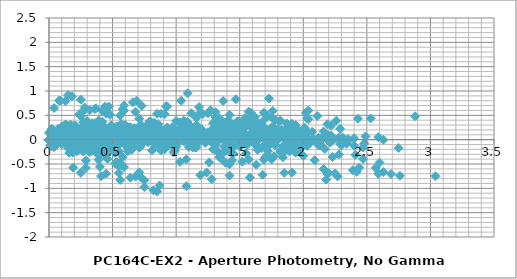
| Category | Series 0 |
|---|---|
| 0.1899999999999995 | -0.091 |
| 1.8800000000000008 | 0.168 |
| 0.2400000000000002 | -0.039 |
| 2.1799999999999997 | 0.033 |
| 1.4399999999999995 | 0.062 |
| 1.6300000000000008 | -0.514 |
| 0.7200000000000006 | 0.01 |
| 0.47000000000000064 | -0.063 |
| 1.9499999999999993 | 0.093 |
| 1.2100000000000009 | 0.073 |
| 1.7599999999999998 | 0.276 |
| 0.13000000000000078 | 0.076 |
| 0.0600000000000005 | -0.084 |
| 0.9499999999999993 | 0.057 |
| 2.08 | 0.018 |
| 0.3800000000000008 | 0.027 |
| 1.0500000000000007 | 0.112 |
| 1.3900000000000006 | 0.009 |
| 0.7799999999999994 | 0.018 |
| 2.0700000000000003 | 0.163 |
| 2.4700000000000006 | -0.395 |
| 0.41000000000000014 | 0.085 |
| 0.4499999999999993 | 0.156 |
| 0.35999999999999943 | 0.09 |
| 1.3499999999999996 | 0.147 |
| 1.9900000000000002 | 0.116 |
| 1.9100000000000001 | 0.101 |
| 1.7799999999999994 | 0.402 |
| 0.21000000000000085 | -0.004 |
| 1.8800000000000008 | 0.309 |
| 0.4399999999999995 | 0.04 |
| 0.0600000000000005 | 0.04 |
| 0.4299999999999997 | 0.024 |
| 1.8100000000000005 | 0.374 |
| 0.040000000000000924 | 0.034 |
| 2.34 | -0.084 |
| 2.2200000000000006 | 0.084 |
| 1.5500000000000007 | 0.289 |
| 2.630000000000001 | -0.665 |
| 1.5899999999999999 | 0.135 |
| 1.540000000000001 | 0.287 |
| 1.2599999999999998 | 0.13 |
| 0.9000000000000004 | 0.18 |
| 1.1600000000000001 | 0.167 |
| 1.6900000000000013 | 0.26 |
| 0.05000000000000071 | 0.052 |
| 1.9900000000000002 | 0.125 |
| 1.25 | 0.154 |
| 1.4400000000000013 | -0.423 |
| 0.5300000000000011 | 0.102 |
| 0.28000000000000114 | 0.028 |
| 1.7599999999999998 | 0.184 |
| 1.0200000000000014 | 0.164 |
| 1.5700000000000003 | 0.367 |
| 0.3200000000000003 | 0.167 |
| 0.129999999999999 | 0.008 |
| 0.7599999999999998 | 0.148 |
| 1.8900000000000006 | 0.11 |
| 0.19000000000000128 | 0.118 |
| 0.8600000000000012 | 0.203 |
| 1.200000000000001 | 0.101 |
| 0.5899999999999999 | 0.109 |
| 1.8800000000000008 | 0.254 |
| 2.280000000000001 | -0.304 |
| 0.5999999999999996 | 0.177 |
| 0.2599999999999998 | 0.248 |
| 0.16999999999999993 | 0.181 |
| 1.1600000000000001 | 0.238 |
| 1.8000000000000007 | 0.207 |
| 1.7200000000000006 | 0.192 |
| 1.5899999999999999 | 0.493 |
| 0.02000000000000135 | 0.088 |
| 1.6900000000000013 | 0.4 |
| 0.25 | 0.131 |
| 0.25 | 0.132 |
| 0.2400000000000002 | 0.115 |
| 1.620000000000001 | 0.465 |
| 0.14999999999999858 | 0.126 |
| 2.1500000000000004 | 0.007 |
| 2.030000000000001 | 0.175 |
| 1.3600000000000012 | 0.38 |
| 2.4400000000000013 | -0.574 |
| 1.4000000000000004 | 0.227 |
| 1.3500000000000014 | 0.378 |
| 1.0700000000000003 | 0.221 |
| 0.7100000000000009 | 0.271 |
| 0.9700000000000006 | 0.258 |
| 1.6400000000000006 | -0.207 |
| 0.29999999999999893 | -0.135 |
| 0.4400000000000013 | -0.106 |
| 0.25 | -0.683 |
| 1.1600000000000001 | -0.158 |
| 1.4100000000000001 | -0.231 |
| 0.06999999999999851 | -0.076 |
| 0.6699999999999999 | -0.096 |
| 0.120000000000001 | 0.108 |
| 2.0100000000000016 | -0.092 |
| 1.8200000000000003 | -0.252 |
| 0.9300000000000015 | -0.111 |
| 0.1999999999999993 | -0.15 |
| 1.5 | -0.142 |
| 0.8300000000000001 | -0.056 |
| 0.4900000000000002 | -0.159 |
| 1.1000000000000014 | -0.151 |
| 0.1899999999999995 | -0.006 |
| 0.5899999999999999 | -0.564 |
| 2.290000000000001 | -0.083 |
| 1.4300000000000015 | -0.012 |
| 1.5200000000000014 | -0.078 |
| 0.5300000000000011 | -0.022 |
| 0.10999999999999943 | -0.052 |
| 0.02999999999999936 | -0.067 |
| 0.10000000000000142 | 0.233 |
| 1.67 | -0.172 |
| 0.0 | 0.141 |
| 1.4400000000000013 | -0.129 |
| 1.9400000000000013 | -0.128 |
| 1.450000000000001 | -0.144 |
| 0.07000000000000028 | 0.206 |
| 1.8399999999999999 | -0.134 |
| 0.4599999999999991 | -0.252 |
| 0.33999999999999986 | -0.085 |
| 0.33000000000000007 | 0.121 |
| 0.75 | -0.834 |
| 0.2900000000000009 | -0.033 |
| 0.33999999999999986 | 0.118 |
| 0.620000000000001 | -0.038 |
| 0.9800000000000004 | 0.011 |
| 0.7200000000000006 | -0.001 |
| 1.9399999999999995 | 0.072 |
| 1.1999999999999993 | 0.101 |
| 1.3900000000000006 | -0.475 |
| 0.4800000000000004 | 0.049 |
| 0.23000000000000043 | -0.024 |
| 1.709999999999999 | 0.132 |
| 0.9700000000000006 | 0.111 |
| 1.5199999999999996 | 0.315 |
| 0.370000000000001 | 0.115 |
| 0.17999999999999972 | -0.045 |
| 0.7099999999999991 | 0.096 |
| 1.8399999999999999 | 0.057 |
| 0.14000000000000057 | 0.066 |
| 0.8100000000000005 | 0.151 |
| 1.1500000000000004 | 0.048 |
| 0.5399999999999991 | 0.057 |
| 1.83 | 0.202 |
| 2.2300000000000004 | -0.357 |
| 0.6500000000000004 | 0.124 |
| 0.20999999999999908 | 0.195 |
| 0.11999999999999922 | 0.129 |
| 1.1099999999999994 | 0.185 |
| 1.75 | 0.155 |
| 1.67 | 0.14 |
| 1.5399999999999991 | 0.441 |
| 0.02999999999999936 | 0.035 |
| 1.6400000000000006 | 0.348 |
| 0.1999999999999993 | 0.078 |
| 0.3000000000000007 | 0.079 |
| 0.1899999999999995 | 0.063 |
| 1.5700000000000003 | 0.413 |
| 0.1999999999999993 | 0.073 |
| 2.0999999999999996 | -0.045 |
| 1.9800000000000004 | 0.123 |
| 1.3100000000000005 | 0.328 |
| 2.3900000000000006 | -0.627 |
| 1.3499999999999996 | 0.174 |
| 1.3000000000000007 | 0.326 |
| 1.0199999999999996 | 0.169 |
| 0.6600000000000001 | 0.219 |
| 0.9199999999999999 | 0.206 |
| 0.7400000000000002 | 0.029 |
| 0.5499999999999989 | -0.548 |
| 1.459999999999999 | -0.023 |
| 1.709999999999999 | -0.096 |
| 0.23000000000000043 | 0.06 |
| 0.9699999999999989 | 0.039 |
| 0.41999999999999993 | 0.243 |
| 2.3100000000000005 | 0.043 |
| 2.119999999999999 | -0.117 |
| 1.2300000000000004 | 0.024 |
| 0.09999999999999964 | -0.015 |
| 1.799999999999999 | -0.007 |
| 1.129999999999999 | 0.079 |
| 0.7899999999999991 | -0.024 |
| 1.4000000000000004 | -0.016 |
| 0.10999999999999943 | 0.129 |
| 0.2900000000000009 | -0.429 |
| 2.59 | 0.052 |
| 1.7300000000000004 | 0.123 |
| 1.8200000000000003 | 0.057 |
| 0.8300000000000001 | 0.113 |
| 0.1899999999999995 | 0.083 |
| 0.2699999999999996 | 0.068 |
| 0.40000000000000036 | 0.368 |
| 1.9699999999999989 | -0.037 |
| 0.29999999999999893 | 0.276 |
| 1.7400000000000002 | 0.006 |
| 2.24 | 0.007 |
| 1.75 | -0.009 |
| 0.3699999999999992 | 0.341 |
| 2.139999999999999 | 0.001 |
| 0.16000000000000014 | -0.117 |
| 0.040000000000000924 | 0.05 |
| 0.629999999999999 | 0.256 |
| 0.45000000000000107 | -0.699 |
| 0.5899999999999999 | 0.102 |
| 0.6399999999999988 | 0.253 |
| 0.9199999999999999 | 0.097 |
| 1.2799999999999994 | 0.146 |
| 1.0199999999999996 | 0.134 |
| 0.19000000000000128 | -0.577 |
| 0.7199999999999989 | -0.052 |
| 0.9699999999999989 | -0.125 |
| 0.5099999999999998 | 0.031 |
| 0.22999999999999865 | 0.01 |
| 0.3200000000000003 | 0.214 |
| 1.5700000000000003 | 0.014 |
| 1.379999999999999 | -0.146 |
| 0.4900000000000002 | -0.005 |
| 0.6400000000000006 | -0.044 |
| 1.0599999999999987 | -0.036 |
| 0.3899999999999988 | 0.05 |
| 0.049999999999998934 | -0.053 |
| 0.6600000000000001 | -0.045 |
| 0.6300000000000008 | 0.1 |
| 1.0300000000000011 | -0.458 |
| 1.8499999999999996 | 0.023 |
| 0.9900000000000002 | 0.094 |
| 1.08 | 0.028 |
| 0.08999999999999986 | 0.084 |
| 0.5500000000000007 | 0.054 |
| 0.47000000000000064 | 0.039 |
| 0.33999999999999986 | 0.339 |
| 1.2299999999999986 | -0.066 |
| 0.4400000000000013 | 0.247 |
| 1.0 | -0.023 |
| 1.5 | -0.022 |
| 1.0099999999999998 | -0.038 |
| 0.370000000000001 | 0.312 |
| 1.3999999999999986 | -0.028 |
| 0.9000000000000004 | -0.146 |
| 0.7800000000000011 | 0.021 |
| 0.11000000000000121 | 0.227 |
| 1.1900000000000013 | -0.728 |
| 0.15000000000000036 | 0.073 |
| 0.10000000000000142 | 0.224 |
| 0.17999999999999972 | 0.068 |
| 0.5399999999999991 | 0.117 |
| 0.27999999999999936 | 0.105 |
| 0.9100000000000001 | 0.525 |
| 1.1600000000000001 | 0.451 |
| 0.3199999999999985 | 0.607 |
| 0.41999999999999993 | 0.587 |
| 0.129999999999999 | 0.79 |
| 1.7600000000000016 | 0.59 |
| 1.5700000000000003 | 0.431 |
| 0.6800000000000015 | 0.571 |
| 0.4499999999999993 | 0.532 |
| 1.25 | 0.541 |
| 0.5800000000000001 | 0.626 |
| 0.2400000000000002 | 0.524 |
| 0.8500000000000014 | 0.532 |
| 0.4399999999999995 | 0.677 |
| 0.8399999999999999 | 0.119 |
| 2.040000000000001 | 0.6 |
| 1.1800000000000015 | 0.67 |
| 1.2700000000000014 | 0.604 |
| 0.28000000000000114 | 0.661 |
| 0.35999999999999943 | 0.63 |
| 0.27999999999999936 | 0.615 |
| 0.14999999999999858 | 0.916 |
| 1.42 | 0.511 |
| 0.25 | 0.823 |
| 1.1900000000000013 | 0.554 |
| 1.6900000000000013 | 0.554 |
| 1.200000000000001 | 0.538 |
| 0.17999999999999972 | 0.888 |
| 1.5899999999999999 | 0.549 |
| 0.7099999999999991 | 0.43 |
| 0.5899999999999999 | 0.598 |
| 0.08000000000000007 | 0.803 |
| 1.0 | -0.151 |
| 0.040000000000000924 | 0.65 |
| 0.08999999999999986 | 0.801 |
| 0.370000000000001 | 0.644 |
| 0.7300000000000004 | 0.694 |
| 0.47000000000000064 | 0.681 |
| 0.25 | -0.074 |
| 1.2299999999999986 | 0.082 |
| 0.4900000000000002 | 0.062 |
| 1.0399999999999991 | 0.266 |
| 0.8500000000000014 | 0.065 |
| 0.6600000000000001 | -0.094 |
| 0.22999999999999865 | 0.047 |
| 1.3599999999999994 | 0.008 |
| 0.33999999999999986 | 0.016 |
| 0.33000000000000007 | 0.102 |
| 0.6699999999999999 | -0.001 |
| 0.05999999999999872 | 0.007 |
| 1.3499999999999996 | 0.152 |
| 1.75 | -0.406 |
| 1.1300000000000008 | 0.075 |
| 0.27000000000000135 | 0.146 |
| 0.3600000000000012 | 0.08 |
| 0.629999999999999 | 0.136 |
| 1.2699999999999996 | 0.105 |
| 1.1899999999999995 | 0.091 |
| 1.0599999999999987 | 0.391 |
| 0.5099999999999998 | -0.014 |
| 1.1600000000000001 | 0.299 |
| 0.28000000000000114 | 0.029 |
| 0.7800000000000011 | 0.03 |
| 0.2900000000000009 | 0.014 |
| 1.0899999999999999 | 0.363 |
| 0.6799999999999997 | 0.024 |
| 1.6199999999999992 | -0.094 |
| 1.5 | 0.073 |
| 0.8300000000000001 | 0.279 |
| 1.9100000000000001 | -0.676 |
| 0.8699999999999992 | 0.125 |
| 0.8200000000000003 | 0.276 |
| 0.5399999999999991 | 0.12 |
| 0.17999999999999972 | 0.169 |
| 0.4399999999999995 | 0.157 |
| 1.4799999999999986 | 0.156 |
| 0.7400000000000002 | 0.136 |
| 1.2899999999999991 | 0.339 |
| 0.6000000000000014 | 0.139 |
| 0.41000000000000014 | -0.021 |
| 0.47999999999999865 | 0.12 |
| 1.6099999999999994 | 0.081 |
| 0.08999999999999986 | 0.09 |
| 0.5800000000000001 | 0.175 |
| 0.9199999999999999 | 0.072 |
| 0.3099999999999987 | 0.081 |
| 1.5999999999999996 | 0.226 |
| 2.0 | -0.332 |
| 0.8800000000000008 | 0.148 |
| 0.02000000000000135 | 0.219 |
| 0.11000000000000121 | 0.153 |
| 0.879999999999999 | 0.21 |
| 1.5199999999999996 | 0.179 |
| 1.4399999999999995 | 0.164 |
| 1.3099999999999987 | 0.465 |
| 0.2599999999999998 | 0.059 |
| 1.4100000000000001 | 0.372 |
| 0.030000000000001137 | 0.103 |
| 0.5300000000000011 | 0.103 |
| 0.040000000000000924 | 0.087 |
| 1.3399999999999999 | 0.437 |
| 0.4299999999999997 | 0.097 |
| 1.8699999999999992 | -0.021 |
| 1.75 | 0.147 |
| 1.08 | 0.352 |
| 2.16 | -0.602 |
| 1.1199999999999992 | 0.199 |
| 1.0700000000000003 | 0.35 |
| 0.7899999999999991 | 0.193 |
| 0.4299999999999997 | 0.243 |
| 0.6899999999999995 | 0.23 |
| 0.7399999999999984 | -0.02 |
| 0.1899999999999995 | 0.183 |
| 2.08 | -0.017 |
| 1.8899999999999988 | -0.176 |
| 1.0 | -0.036 |
| 0.13000000000000078 | -0.075 |
| 1.5699999999999985 | -0.066 |
| 0.8999999999999986 | 0.019 |
| 0.5599999999999987 | -0.084 |
| 1.17 | -0.075 |
| 0.120000000000001 | 0.07 |
| 0.5200000000000014 | -0.488 |
| 2.3599999999999994 | -0.008 |
| 1.5 | 0.063 |
| 1.5899999999999999 | -0.003 |
| 0.5999999999999996 | 0.054 |
| 0.040000000000000924 | 0.023 |
| 0.03999999999999915 | 0.008 |
| 0.16999999999999993 | 0.309 |
| 1.7399999999999984 | -0.097 |
| 0.06999999999999851 | 0.216 |
| 1.5099999999999998 | -0.053 |
| 2.01 | -0.053 |
| 1.5199999999999996 | -0.069 |
| 0.1399999999999988 | 0.281 |
| 1.9099999999999984 | -0.059 |
| 0.39000000000000057 | -0.177 |
| 0.27000000000000135 | -0.009 |
| 0.3999999999999986 | 0.196 |
| 0.6800000000000015 | -0.758 |
| 0.35999999999999943 | 0.043 |
| 0.40999999999999837 | 0.194 |
| 0.6899999999999995 | 0.037 |
| 1.049999999999999 | 0.087 |
| 0.7899999999999991 | 0.074 |
| 0.5499999999999989 | 0.203 |
| 1.3400000000000016 | 0.003 |
| 1.1500000000000004 | -0.156 |
| 0.26000000000000156 | -0.016 |
| 0.8699999999999992 | -0.054 |
| 0.8300000000000001 | -0.046 |
| 0.16000000000000014 | 0.039 |
| 0.17999999999999972 | -0.063 |
| 0.4300000000000015 | -0.055 |
| 0.8599999999999994 | 0.09 |
| 1.2599999999999998 | -0.468 |
| 1.620000000000001 | 0.013 |
| 0.7600000000000016 | 0.084 |
| 0.8500000000000014 | 0.017 |
| 0.1399999999999988 | 0.074 |
| 0.7799999999999994 | 0.043 |
| 0.6999999999999993 | 0.029 |
| 0.5699999999999985 | 0.329 |
| 1.0 | -0.076 |
| 0.6699999999999999 | 0.236 |
| 0.7700000000000014 | -0.033 |
| 1.2700000000000014 | -0.032 |
| 0.7800000000000011 | -0.048 |
| 0.5999999999999996 | 0.301 |
| 1.17 | -0.038 |
| 1.129999999999999 | -0.156 |
| 1.0099999999999998 | 0.011 |
| 0.33999999999999986 | 0.216 |
| 1.42 | -0.738 |
| 0.379999999999999 | 0.063 |
| 0.33000000000000007 | 0.214 |
| 0.049999999999998934 | 0.058 |
| 0.3100000000000005 | 0.107 |
| 0.05000000000000071 | 0.094 |
| 1.8900000000000006 | -0.2 |
| 1.6999999999999993 | -0.36 |
| 0.8100000000000005 | -0.219 |
| 0.3200000000000003 | -0.258 |
| 1.379999999999999 | -0.249 |
| 0.7099999999999991 | -0.164 |
| 0.3699999999999992 | -0.267 |
| 0.9800000000000004 | -0.258 |
| 0.3100000000000005 | -0.113 |
| 0.7100000000000009 | -0.671 |
| 2.17 | -0.191 |
| 1.3100000000000005 | -0.12 |
| 1.4000000000000004 | -0.186 |
| 0.41000000000000014 | -0.13 |
| 0.23000000000000043 | -0.16 |
| 0.15000000000000036 | -0.175 |
| 0.019999999999999574 | 0.126 |
| 1.549999999999999 | -0.28 |
| 0.120000000000001 | 0.033 |
| 1.3200000000000003 | -0.236 |
| 1.8200000000000003 | -0.236 |
| 1.33 | -0.252 |
| 0.05000000000000071 | 0.098 |
| 1.7199999999999989 | -0.242 |
| 0.5800000000000001 | -0.36 |
| 0.46000000000000085 | -0.192 |
| 0.20999999999999908 | 0.013 |
| 0.870000000000001 | -0.941 |
| 0.16999999999999993 | -0.141 |
| 0.21999999999999886 | 0.011 |
| 0.5 | -0.146 |
| 0.8599999999999994 | -0.096 |
| 0.5999999999999996 | -0.109 |
| 0.19000000000000128 | -0.16 |
| 1.08 | -0.019 |
| 2.210000000000001 | -0.058 |
| 0.5100000000000016 | -0.049 |
| 1.1800000000000015 | 0.036 |
| 1.5200000000000014 | -0.067 |
| 0.9100000000000001 | -0.058 |
| 2.200000000000001 | 0.087 |
| 2.6000000000000014 | -0.471 |
| 0.27999999999999936 | 0.009 |
| 0.5800000000000001 | 0.08 |
| 0.4900000000000002 | 0.014 |
| 1.4800000000000004 | 0.071 |
| 2.120000000000001 | 0.04 |
| 2.040000000000001 | 0.025 |
| 1.9100000000000001 | 0.326 |
| 0.34000000000000163 | -0.08 |
| 2.0100000000000016 | 0.233 |
| 0.5700000000000003 | -0.036 |
| 0.07000000000000028 | -0.036 |
| 0.5600000000000005 | -0.052 |
| 1.9400000000000013 | 0.298 |
| 0.1700000000000017 | -0.042 |
| 2.4700000000000006 | -0.16 |
| 2.3500000000000014 | 0.008 |
| 1.6800000000000015 | 0.213 |
| 2.7600000000000016 | -0.741 |
| 1.7200000000000006 | 0.06 |
| 1.6700000000000017 | 0.211 |
| 1.3900000000000006 | 0.054 |
| 1.0300000000000011 | 0.104 |
| 1.290000000000001 | 0.091 |
| 0.8899999999999988 | 0.141 |
| 2.0199999999999996 | 0.102 |
| 0.3200000000000003 | 0.11 |
| 0.9900000000000002 | 0.196 |
| 1.33 | 0.093 |
| 0.7199999999999989 | 0.101 |
| 2.01 | 0.246 |
| 2.41 | -0.312 |
| 0.47000000000000064 | 0.169 |
| 0.3899999999999988 | 0.24 |
| 0.29999999999999893 | 0.174 |
| 1.2899999999999991 | 0.23 |
| 1.9299999999999997 | 0.2 |
| 1.8499999999999996 | 0.185 |
| 1.7199999999999989 | 0.485 |
| 0.15000000000000036 | 0.08 |
| 1.8200000000000003 | 0.393 |
| 0.379999999999999 | 0.123 |
| 0.120000000000001 | 0.124 |
| 0.3699999999999992 | 0.108 |
| 1.75 | 0.457 |
| 0.019999999999999574 | 0.118 |
| 2.2799999999999994 | 0 |
| 2.16 | 0.167 |
| 1.4900000000000002 | 0.373 |
| 2.5700000000000003 | -0.582 |
| 1.5299999999999994 | 0.219 |
| 1.4800000000000004 | 0.37 |
| 1.1999999999999993 | 0.214 |
| 0.8399999999999999 | 0.263 |
| 1.0999999999999996 | 0.251 |
| 1.1300000000000008 | -0.039 |
| 0.5699999999999985 | -0.03 |
| 0.10000000000000142 | 0.055 |
| 0.4400000000000013 | -0.048 |
| 0.16999999999999993 | -0.039 |
| 1.120000000000001 | 0.106 |
| 1.5200000000000014 | -0.452 |
| 1.3599999999999994 | 0.028 |
| 0.5 | 0.099 |
| 0.5899999999999999 | 0.033 |
| 0.40000000000000036 | 0.09 |
| 1.040000000000001 | 0.059 |
| 0.9600000000000009 | 0.044 |
| 0.8300000000000001 | 0.345 |
| 0.7399999999999984 | -0.061 |
| 0.9300000000000015 | 0.252 |
| 0.5099999999999998 | -0.017 |
| 1.0099999999999998 | -0.017 |
| 0.5199999999999996 | -0.033 |
| 0.8600000000000012 | 0.317 |
| 0.9099999999999984 | -0.023 |
| 1.3900000000000006 | -0.141 |
| 1.2700000000000014 | 0.027 |
| 0.6000000000000014 | 0.232 |
| 1.6800000000000015 | -0.722 |
| 0.6400000000000006 | 0.079 |
| 0.5900000000000016 | 0.23 |
| 0.3100000000000005 | 0.073 |
| 0.049999999999998934 | 0.123 |
| 0.21000000000000085 | 0.11 |
| 1.6999999999999993 | 0.009 |
| 1.0299999999999994 | 0.094 |
| 0.6899999999999995 | -0.009 |
| 1.3000000000000007 | -0.001 |
| 0.009999999999999787 | 0.144 |
| 0.39000000000000057 | -0.414 |
| 2.49 | 0.067 |
| 1.6300000000000008 | 0.138 |
| 1.7200000000000006 | 0.072 |
| 0.7300000000000004 | 0.128 |
| 0.08999999999999986 | 0.098 |
| 0.16999999999999993 | 0.083 |
| 0.3000000000000007 | 0.383 |
| 1.8699999999999992 | -0.022 |
| 0.1999999999999993 | 0.291 |
| 1.6400000000000006 | 0.021 |
| 2.1400000000000006 | 0.022 |
| 1.6500000000000004 | 0.006 |
| 0.2699999999999996 | 0.356 |
| 2.039999999999999 | 0.016 |
| 0.2599999999999998 | -0.102 |
| 0.14000000000000057 | 0.066 |
| 0.5299999999999994 | 0.271 |
| 0.5500000000000007 | -0.684 |
| 0.4900000000000002 | 0.117 |
| 0.5399999999999991 | 0.269 |
| 0.8200000000000003 | 0.112 |
| 1.1799999999999997 | 0.162 |
| 0.9199999999999999 | 0.149 |
| 0.6699999999999999 | 0.085 |
| 1.0099999999999998 | -0.017 |
| 0.3999999999999986 | -0.009 |
| 1.6899999999999995 | 0.136 |
| 2.09 | -0.422 |
| 0.7900000000000009 | 0.058 |
| 0.06999999999999851 | 0.129 |
| 0.02000000000000135 | 0.063 |
| 0.9699999999999989 | 0.12 |
| 1.6099999999999994 | 0.089 |
| 1.5299999999999994 | 0.074 |
| 1.3999999999999986 | 0.375 |
| 0.16999999999999993 | -0.031 |
| 1.5 | 0.282 |
| 0.05999999999999872 | 0.013 |
| 0.4400000000000013 | 0.013 |
| 0.049999999999998934 | -0.003 |
| 1.4299999999999997 | 0.347 |
| 0.33999999999999986 | 0.007 |
| 1.959999999999999 | -0.111 |
| 1.8399999999999999 | 0.057 |
| 1.17 | 0.262 |
| 2.25 | -0.692 |
| 1.209999999999999 | 0.109 |
| 1.1600000000000001 | 0.26 |
| 0.879999999999999 | 0.103 |
| 0.5199999999999996 | 0.153 |
| 0.7799999999999994 | 0.14 |
| 0.33999999999999986 | -0.103 |
| 0.27000000000000135 | -0.094 |
| 1.0199999999999996 | 0.051 |
| 1.42 | -0.507 |
| 1.4600000000000009 | -0.027 |
| 0.6000000000000014 | 0.044 |
| 0.6900000000000013 | -0.022 |
| 0.29999999999999893 | 0.034 |
| 0.9399999999999995 | 0.004 |
| 0.8599999999999994 | -0.011 |
| 0.7299999999999986 | 0.29 |
| 0.8399999999999999 | -0.116 |
| 0.8300000000000001 | 0.197 |
| 0.6100000000000012 | -0.072 |
| 1.1100000000000012 | -0.072 |
| 0.620000000000001 | -0.088 |
| 0.7599999999999998 | 0.262 |
| 1.0099999999999998 | -0.078 |
| 1.2899999999999991 | -0.196 |
| 1.17 | -0.028 |
| 0.5 | 0.177 |
| 1.58 | -0.777 |
| 0.5399999999999991 | 0.023 |
| 0.4900000000000002 | 0.175 |
| 0.20999999999999908 | 0.018 |
| 0.15000000000000036 | 0.068 |
| 0.10999999999999943 | 0.055 |
| 0.6100000000000012 | 0.008 |
| 0.6799999999999997 | 0.153 |
| 1.08 | -0.405 |
| 1.8000000000000007 | 0.076 |
| 0.9400000000000013 | 0.147 |
| 1.0300000000000011 | 0.081 |
| 0.040000000000000924 | 0.137 |
| 0.5999999999999996 | 0.107 |
| 0.5199999999999996 | 0.092 |
| 0.3899999999999988 | 0.392 |
| 1.1799999999999997 | -0.013 |
| 0.4900000000000002 | 0.3 |
| 0.9500000000000011 | 0.03 |
| 1.450000000000001 | 0.031 |
| 0.9600000000000009 | 0.015 |
| 0.41999999999999993 | 0.365 |
| 1.3499999999999996 | 0.025 |
| 0.9499999999999993 | -0.093 |
| 0.8300000000000001 | 0.074 |
| 0.16000000000000014 | 0.28 |
| 1.2400000000000002 | -0.675 |
| 0.1999999999999993 | 0.126 |
| 0.15000000000000036 | 0.277 |
| 0.13000000000000078 | 0.121 |
| 0.4900000000000002 | 0.17 |
| 0.23000000000000043 | 0.158 |
| 1.290000000000001 | 0.145 |
| 1.6900000000000013 | -0.413 |
| 1.1899999999999995 | 0.068 |
| 0.33000000000000007 | 0.139 |
| 0.41999999999999993 | 0.072 |
| 0.5700000000000003 | 0.129 |
| 1.2100000000000009 | 0.098 |
| 1.1300000000000008 | 0.083 |
| 1.0 | 0.384 |
| 0.5699999999999985 | -0.021 |
| 1.1000000000000014 | 0.291 |
| 0.33999999999999986 | 0.022 |
| 0.8399999999999999 | 0.022 |
| 0.34999999999999964 | 0.006 |
| 1.0300000000000011 | 0.356 |
| 0.7399999999999984 | 0.017 |
| 1.5600000000000005 | -0.102 |
| 1.4400000000000013 | 0.066 |
| 0.7700000000000014 | 0.271 |
| 1.8500000000000014 | -0.683 |
| 0.8100000000000005 | 0.118 |
| 0.7600000000000016 | 0.269 |
| 0.4800000000000004 | 0.112 |
| 0.120000000000001 | 0.162 |
| 0.3800000000000008 | 0.149 |
| 0.40000000000000036 | -0.558 |
| 2.4800000000000004 | -0.077 |
| 1.620000000000001 | -0.006 |
| 1.7100000000000009 | -0.073 |
| 0.7200000000000006 | -0.016 |
| 0.08000000000000007 | -0.047 |
| 0.16000000000000014 | -0.062 |
| 0.2900000000000009 | 0.239 |
| 1.8599999999999994 | -0.166 |
| 0.1899999999999995 | 0.146 |
| 1.6300000000000008 | -0.123 |
| 2.130000000000001 | -0.123 |
| 1.6400000000000006 | -0.139 |
| 0.2599999999999998 | 0.211 |
| 2.0299999999999994 | -0.128 |
| 0.2699999999999996 | -0.247 |
| 0.15000000000000036 | -0.079 |
| 0.5199999999999996 | 0.126 |
| 0.5600000000000005 | -0.828 |
| 0.4800000000000004 | -0.027 |
| 0.5299999999999994 | 0.124 |
| 0.8100000000000005 | -0.033 |
| 1.17 | 0.017 |
| 0.9100000000000001 | 0.004 |
| 2.880000000000001 | 0.481 |
| 2.0200000000000014 | 0.552 |
| 2.110000000000001 | 0.486 |
| 1.120000000000001 | 0.542 |
| 0.4800000000000004 | 0.511 |
| 0.5600000000000005 | 0.497 |
| 0.6900000000000013 | 0.797 |
| 2.26 | 0.392 |
| 0.5899999999999999 | 0.704 |
| 2.030000000000001 | 0.435 |
| 2.530000000000001 | 0.436 |
| 2.040000000000001 | 0.42 |
| 0.6600000000000001 | 0.769 |
| 2.4299999999999997 | 0.43 |
| 0.13000000000000078 | 0.312 |
| 0.25 | 0.479 |
| 0.9199999999999999 | 0.684 |
| 0.16000000000000014 | -0.27 |
| 0.8800000000000008 | 0.531 |
| 0.9299999999999997 | 0.682 |
| 1.2100000000000009 | 0.526 |
| 1.5700000000000003 | 0.575 |
| 1.3100000000000005 | 0.562 |
| 0.8599999999999994 | 0.071 |
| 0.7699999999999996 | 0.005 |
| 1.7599999999999998 | 0.061 |
| 2.4000000000000004 | 0.031 |
| 2.3200000000000003 | 0.016 |
| 2.1899999999999995 | 0.316 |
| 0.620000000000001 | -0.089 |
| 2.290000000000001 | 0.224 |
| 0.8499999999999996 | -0.046 |
| 0.34999999999999964 | -0.045 |
| 0.8399999999999999 | -0.061 |
| 2.2200000000000006 | 0.289 |
| 0.45000000000000107 | -0.051 |
| 2.75 | -0.169 |
| 2.630000000000001 | -0.002 |
| 1.9600000000000009 | 0.204 |
| 3.040000000000001 | -0.751 |
| 2.0 | 0.05 |
| 1.950000000000001 | 0.202 |
| 1.67 | 0.045 |
| 1.3100000000000005 | 0.095 |
| 1.5700000000000003 | 0.082 |
| 0.08999999999999986 | -0.066 |
| 0.9000000000000004 | -0.01 |
| 1.540000000000001 | -0.04 |
| 1.4600000000000009 | -0.055 |
| 1.33 | 0.245 |
| 0.23999999999999844 | -0.16 |
| 1.4300000000000015 | 0.153 |
| 0.009999999999999787 | -0.117 |
| 0.5099999999999998 | -0.116 |
| 0.019999999999999574 | -0.132 |
| 1.3600000000000012 | 0.218 |
| 0.40999999999999837 | -0.122 |
| 1.8900000000000006 | -0.24 |
| 1.7700000000000014 | -0.072 |
| 1.1000000000000014 | 0.133 |
| 2.1800000000000015 | -0.822 |
| 1.1400000000000006 | -0.021 |
| 1.0900000000000016 | 0.131 |
| 0.8100000000000005 | -0.026 |
| 0.45000000000000107 | 0.024 |
| 0.7100000000000009 | 0.011 |
| 0.9900000000000002 | 0.056 |
| 1.6300000000000008 | 0.026 |
| 1.5500000000000007 | 0.011 |
| 1.42 | 0.312 |
| 0.14999999999999858 | -0.094 |
| 1.5200000000000014 | 0.219 |
| 0.08000000000000007 | -0.051 |
| 0.41999999999999993 | -0.05 |
| 0.07000000000000028 | -0.066 |
| 1.450000000000001 | 0.284 |
| 0.3199999999999985 | -0.056 |
| 1.9800000000000004 | -0.174 |
| 1.8600000000000012 | -0.006 |
| 1.1900000000000013 | 0.199 |
| 2.2700000000000014 | -0.755 |
| 1.2300000000000004 | 0.045 |
| 1.1800000000000015 | 0.197 |
| 0.9000000000000004 | 0.04 |
| 0.5400000000000009 | 0.09 |
| 0.8000000000000007 | 0.077 |
| 0.6400000000000006 | -0.031 |
| 0.5600000000000005 | -0.045 |
| 0.4299999999999997 | 0.255 |
| 1.1399999999999988 | -0.15 |
| 0.5300000000000011 | 0.162 |
| 0.9100000000000001 | -0.107 |
| 1.4100000000000001 | -0.106 |
| 0.9199999999999999 | -0.122 |
| 0.46000000000000085 | 0.227 |
| 1.3099999999999987 | -0.112 |
| 0.9900000000000002 | -0.23 |
| 0.870000000000001 | -0.063 |
| 0.20000000000000107 | 0.143 |
| 1.2800000000000011 | -0.812 |
| 0.2400000000000002 | -0.011 |
| 0.19000000000000128 | 0.14 |
| 0.08999999999999986 | -0.016 |
| 0.4499999999999993 | 0.033 |
| 0.1899999999999995 | 0.02 |
| 0.08000000000000007 | -0.015 |
| 0.21000000000000085 | 0.286 |
| 1.7799999999999994 | -0.12 |
| 0.10999999999999943 | 0.193 |
| 1.5500000000000007 | -0.076 |
| 2.0500000000000007 | -0.076 |
| 1.5600000000000005 | -0.092 |
| 0.17999999999999972 | 0.258 |
| 1.9499999999999993 | -0.082 |
| 0.34999999999999964 | -0.2 |
| 0.23000000000000043 | -0.032 |
| 0.4399999999999995 | 0.173 |
| 0.6400000000000006 | -0.781 |
| 0.40000000000000036 | 0.02 |
| 0.4499999999999993 | 0.171 |
| 0.7300000000000004 | 0.014 |
| 1.0899999999999999 | 0.064 |
| 0.8300000000000001 | 0.051 |
| 0.13000000000000078 | 0.301 |
| 1.6999999999999993 | -0.105 |
| 0.02999999999999936 | 0.208 |
| 1.4700000000000006 | -0.062 |
| 1.9700000000000006 | -0.061 |
| 1.4800000000000004 | -0.077 |
| 0.09999999999999964 | 0.273 |
| 1.8699999999999992 | -0.067 |
| 0.4299999999999997 | -0.185 |
| 0.3100000000000005 | -0.017 |
| 0.35999999999999943 | 0.188 |
| 0.7200000000000006 | -0.767 |
| 0.3200000000000003 | 0.034 |
| 0.3699999999999992 | 0.186 |
| 0.6500000000000004 | 0.029 |
| 1.0099999999999998 | 0.079 |
| 0.75 | 0.066 |
| 1.5699999999999985 | -0.405 |
| 0.10000000000000142 | -0.093 |
| 1.3399999999999999 | -0.362 |
| 1.8399999999999999 | -0.361 |
| 1.3499999999999996 | -0.378 |
| 0.030000000000001137 | -0.028 |
| 1.7399999999999984 | -0.367 |
| 0.5600000000000005 | -0.486 |
| 0.4400000000000013 | -0.318 |
| 0.22999999999999865 | -0.113 |
| 0.8500000000000014 | -1.067 |
| 0.1899999999999995 | -0.266 |
| 0.23999999999999844 | -0.115 |
| 0.5199999999999996 | -0.272 |
| 0.879999999999999 | -0.222 |
| 0.6199999999999992 | -0.235 |
| 1.67 | 0.313 |
| 0.22999999999999865 | 0.043 |
| 0.27000000000000135 | 0.044 |
| 0.21999999999999886 | 0.028 |
| 1.5999999999999996 | 0.378 |
| 0.16999999999999993 | 0.038 |
| 2.129999999999999 | -0.08 |
| 2.01 | 0.087 |
| 1.3399999999999999 | 0.293 |
| 2.42 | -0.662 |
| 1.379999999999999 | 0.139 |
| 1.33 | 0.291 |
| 1.049999999999999 | 0.134 |
| 0.6899999999999995 | 0.184 |
| 0.9499999999999993 | 0.171 |
| 1.4400000000000013 | -0.269 |
| 1.9400000000000013 | -0.269 |
| 1.450000000000001 | -0.285 |
| 0.07000000000000028 | 0.065 |
| 1.8399999999999999 | -0.275 |
| 0.4599999999999991 | -0.393 |
| 0.33999999999999986 | -0.225 |
| 0.33000000000000007 | -0.02 |
| 0.75 | -0.974 |
| 0.2900000000000009 | -0.173 |
| 0.33999999999999986 | -0.022 |
| 0.620000000000001 | -0.179 |
| 0.9800000000000004 | -0.129 |
| 0.7200000000000006 | -0.142 |
| 0.5 | 0.001 |
| 0.009999999999999787 | -0.015 |
| 1.370000000000001 | 0.334 |
| 0.3999999999999986 | -0.005 |
| 1.9000000000000004 | -0.123 |
| 1.7800000000000011 | 0.044 |
| 1.1100000000000012 | 0.249 |
| 2.1900000000000013 | -0.705 |
| 1.1500000000000004 | 0.096 |
| 1.1000000000000014 | 0.247 |
| 0.8200000000000003 | 0.091 |
| 0.46000000000000085 | 0.14 |
| 0.7200000000000006 | 0.127 |
| 0.4900000000000002 | -0.016 |
| 1.870000000000001 | 0.334 |
| 0.10000000000000142 | -0.006 |
| 2.4000000000000004 | -0.124 |
| 2.280000000000001 | 0.044 |
| 1.6100000000000012 | 0.249 |
| 2.6900000000000013 | -0.706 |
| 1.6500000000000004 | 0.095 |
| 1.6000000000000014 | 0.247 |
| 1.3200000000000003 | 0.09 |
| 0.9600000000000009 | 0.14 |
| 1.2200000000000006 | 0.127 |
| 1.3800000000000008 | 0.35 |
| 0.3899999999999988 | 0.01 |
| 1.9100000000000001 | -0.108 |
| 1.790000000000001 | 0.06 |
| 1.120000000000001 | 0.265 |
| 2.200000000000001 | -0.69 |
| 1.1600000000000001 | 0.111 |
| 1.1100000000000012 | 0.263 |
| 0.8300000000000001 | 0.106 |
| 0.47000000000000064 | 0.156 |
| 0.7300000000000004 | 0.143 |
| 1.7699999999999996 | -0.34 |
| 0.5299999999999994 | -0.458 |
| 0.41000000000000014 | -0.29 |
| 0.2599999999999998 | -0.085 |
| 0.8200000000000003 | -1.039 |
| 0.22000000000000064 | -0.238 |
| 0.2699999999999996 | -0.087 |
| 0.5500000000000007 | -0.244 |
| 0.9100000000000001 | -0.194 |
| 0.6500000000000004 | -0.207 |
| 2.299999999999999 | -0.118 |
| 2.1799999999999997 | 0.049 |
| 1.5099999999999998 | 0.255 |
| 2.59 | -0.7 |
| 1.549999999999999 | 0.101 |
| 1.5 | 0.253 |
| 1.2199999999999989 | 0.096 |
| 0.8599999999999994 | 0.146 |
| 1.1199999999999992 | 0.133 |
| 0.11999999999999922 | 0.168 |
| 0.7899999999999991 | 0.373 |
| 0.2900000000000009 | -0.582 |
| 0.75 | 0.219 |
| 0.7999999999999989 | 0.371 |
| 1.08 | 0.214 |
| 1.4399999999999995 | 0.264 |
| 1.1799999999999997 | 0.251 |
| 0.6699999999999999 | 0.205 |
| 0.41000000000000014 | -0.749 |
| 0.6300000000000008 | 0.052 |
| 0.6799999999999997 | 0.203 |
| 0.9600000000000009 | 0.046 |
| 1.3200000000000003 | 0.096 |
| 1.0600000000000005 | 0.083 |
| 1.08 | -0.954 |
| 0.03999999999999915 | -0.154 |
| 0.009999999999999787 | -0.002 |
| 0.2900000000000009 | -0.159 |
| 0.6500000000000004 | -0.109 |
| 0.39000000000000057 | -0.122 |
| 1.040000000000001 | 0.801 |
| 1.0899999999999999 | 0.952 |
| 1.370000000000001 | 0.796 |
| 1.7300000000000004 | 0.845 |
| 1.4700000000000006 | 0.832 |
| 0.049999999999998934 | 0.151 |
| 0.33000000000000007 | -0.005 |
| 0.6899999999999995 | 0.044 |
| 0.4299999999999997 | 0.032 |
| 0.28000000000000114 | -0.157 |
| 0.6400000000000006 | -0.107 |
| 0.3800000000000008 | -0.12 |
| 0.35999999999999943 | 0.05 |
| 0.09999999999999964 | 0.037 |
| 0.2599999999999998 | -0.013 |
| 0.0 | 0 |
| 0.0 | 0 |
| 0.0 | 0 |
| 0.0 | 0 |
| 0.0 | 0 |
| 0.0 | 0 |
| 0.0 | 0 |
| 0.0 | 0 |
| 0.0 | 0 |
| 0.0 | 0 |
| 0.0 | 0 |
| 0.0 | 0 |
| 0.0 | 0 |
| 0.0 | 0 |
| 0.0 | 0 |
| 0.0 | 0 |
| 0.0 | 0 |
| 0.0 | 0 |
| 0.0 | 0 |
| 0.0 | 0 |
| 0.0 | 0 |
| 0.0 | 0 |
| 0.0 | 0 |
| 0.0 | 0 |
| 0.0 | 0 |
| 0.0 | 0 |
| 0.0 | 0 |
| 0.0 | 0 |
| 0.0 | 0 |
| 0.0 | 0 |
| 0.0 | 0 |
| 0.0 | 0 |
| 0.0 | 0 |
| 0.0 | 0 |
| 0.0 | 0 |
| 0.0 | 0 |
| 0.0 | 0 |
| 0.0 | 0 |
| 0.0 | 0 |
| 0.0 | 0 |
| 0.0 | 0 |
| 0.0 | 0 |
| 0.0 | 0 |
| 0.0 | 0 |
| 0.0 | 0 |
| 0.0 | 0 |
| 0.0 | 0 |
| 0.0 | 0 |
| 0.0 | 0 |
| 0.0 | 0 |
| 0.0 | 0 |
| 0.0 | 0 |
| 0.0 | 0 |
| 0.0 | 0 |
| 0.0 | 0 |
| 0.0 | 0 |
| 0.0 | 0 |
| 0.0 | 0 |
| 0.0 | 0 |
| 0.0 | 0 |
| 0.0 | 0 |
| 0.0 | 0 |
| 0.0 | 0 |
| 0.0 | 0 |
| 0.0 | 0 |
| 0.0 | 0 |
| 0.0 | 0 |
| 0.0 | 0 |
| 0.0 | 0 |
| 0.0 | 0 |
| 0.0 | 0 |
| 0.0 | 0 |
| 0.0 | 0 |
| 0.0 | 0 |
| 0.0 | 0 |
| 0.0 | 0 |
| 0.0 | 0 |
| 0.0 | 0 |
| 0.0 | 0 |
| 0.0 | 0 |
| 0.0 | 0 |
| 0.0 | 0 |
| 0.0 | 0 |
| 0.0 | 0 |
| 0.0 | 0 |
| 0.0 | 0 |
| 0.0 | 0 |
| 0.0 | 0 |
| 0.0 | 0 |
| 0.0 | 0 |
| 0.0 | 0 |
| 0.0 | 0 |
| 0.0 | 0 |
| 0.0 | 0 |
| 0.0 | 0 |
| 0.0 | 0 |
| 0.0 | 0 |
| 0.0 | 0 |
| 0.0 | 0 |
| 0.0 | 0 |
| 0.0 | 0 |
| 0.0 | 0 |
| 0.0 | 0 |
| 0.0 | 0 |
| 0.0 | 0 |
| 0.0 | 0 |
| 0.0 | 0 |
| 0.0 | 0 |
| 0.0 | 0 |
| 0.0 | 0 |
| 0.0 | 0 |
| 0.0 | 0 |
| 0.0 | 0 |
| 0.0 | 0 |
| 0.0 | 0 |
| 0.0 | 0 |
| 0.0 | 0 |
| 0.0 | 0 |
| 0.0 | 0 |
| 0.0 | 0 |
| 0.0 | 0 |
| 0.0 | 0 |
| 0.0 | 0 |
| 0.0 | 0 |
| 0.0 | 0 |
| 0.0 | 0 |
| 0.0 | 0 |
| 0.0 | 0 |
| 0.0 | 0 |
| 0.0 | 0 |
| 0.0 | 0 |
| 0.0 | 0 |
| 0.0 | 0 |
| 0.0 | 0 |
| 0.0 | 0 |
| 0.0 | 0 |
| 0.0 | 0 |
| 0.0 | 0 |
| 0.0 | 0 |
| 0.0 | 0 |
| 0.0 | 0 |
| 0.0 | 0 |
| 0.0 | 0 |
| 0.0 | 0 |
| 0.0 | 0 |
| 0.0 | 0 |
| 0.0 | 0 |
| 0.0 | 0 |
| 0.0 | 0 |
| 0.0 | 0 |
| 0.0 | 0 |
| 0.0 | 0 |
| 0.0 | 0 |
| 0.0 | 0 |
| 0.0 | 0 |
| 0.0 | 0 |
| 0.0 | 0 |
| 0.0 | 0 |
| 0.0 | 0 |
| 0.0 | 0 |
| 0.0 | 0 |
| 0.0 | 0 |
| 0.0 | 0 |
| 0.0 | 0 |
| 0.0 | 0 |
| 0.0 | 0 |
| 0.0 | 0 |
| 0.0 | 0 |
| 0.0 | 0 |
| 0.0 | 0 |
| 0.0 | 0 |
| 0.0 | 0 |
| 0.0 | 0 |
| 0.0 | 0 |
| 0.0 | 0 |
| 0.0 | 0 |
| 0.0 | 0 |
| 0.0 | 0 |
| 0.0 | 0 |
| 0.0 | 0 |
| 0.0 | 0 |
| 0.0 | 0 |
| 0.0 | 0 |
| 0.0 | 0 |
| 0.0 | 0 |
| 0.0 | 0 |
| 0.0 | 0 |
| 0.0 | 0 |
| 0.0 | 0 |
| 0.0 | 0 |
| 0.0 | 0 |
| 0.0 | 0 |
| 0.0 | 0 |
| 0.0 | 0 |
| 0.0 | 0 |
| 0.0 | 0 |
| 0.0 | 0 |
| 0.0 | 0 |
| 0.0 | 0 |
| 0.0 | 0 |
| 0.0 | 0 |
| 0.0 | 0 |
| 0.0 | 0 |
| 0.0 | 0 |
| 0.0 | 0 |
| 0.0 | 0 |
| 0.0 | 0 |
| 0.0 | 0 |
| 0.0 | 0 |
| 0.0 | 0 |
| 0.0 | 0 |
| 0.0 | 0 |
| 0.0 | 0 |
| 0.0 | 0 |
| 0.0 | 0 |
| 0.0 | 0 |
| 0.0 | 0 |
| 0.0 | 0 |
| 0.0 | 0 |
| 0.0 | 0 |
| 0.0 | 0 |
| 0.0 | 0 |
| 0.0 | 0 |
| 0.0 | 0 |
| 0.0 | 0 |
| 0.0 | 0 |
| 0.0 | 0 |
| 0.0 | 0 |
| 0.0 | 0 |
| 0.0 | 0 |
| 0.0 | 0 |
| 0.0 | 0 |
| 0.0 | 0 |
| 0.0 | 0 |
| 0.0 | 0 |
| 0.0 | 0 |
| 0.0 | 0 |
| 0.0 | 0 |
| 0.0 | 0 |
| 0.0 | 0 |
| 0.0 | 0 |
| 0.0 | 0 |
| 0.0 | 0 |
| 0.0 | 0 |
| 0.0 | 0 |
| 0.0 | 0 |
| 0.0 | 0 |
| 0.0 | 0 |
| 0.0 | 0 |
| 0.0 | 0 |
| 0.0 | 0 |
| 0.0 | 0 |
| 0.0 | 0 |
| 0.0 | 0 |
| 0.0 | 0 |
| 0.0 | 0 |
| 0.0 | 0 |
| 0.0 | 0 |
| 0.0 | 0 |
| 0.0 | 0 |
| 0.0 | 0 |
| 0.0 | 0 |
| 0.0 | 0 |
| 0.0 | 0 |
| 0.0 | 0 |
| 0.0 | 0 |
| 0.0 | 0 |
| 0.0 | 0 |
| 0.0 | 0 |
| 0.0 | 0 |
| 0.0 | 0 |
| 0.0 | 0 |
| 0.0 | 0 |
| 0.0 | 0 |
| 0.0 | 0 |
| 0.0 | 0 |
| 0.0 | 0 |
| 0.0 | 0 |
| 0.0 | 0 |
| 0.0 | 0 |
| 0.0 | 0 |
| 0.0 | 0 |
| 0.0 | 0 |
| 0.0 | 0 |
| 0.0 | 0 |
| 0.0 | 0 |
| 0.0 | 0 |
| 0.0 | 0 |
| 0.0 | 0 |
| 0.0 | 0 |
| 0.0 | 0 |
| 0.0 | 0 |
| 0.0 | 0 |
| 0.0 | 0 |
| 0.0 | 0 |
| 0.0 | 0 |
| 0.0 | 0 |
| 0.0 | 0 |
| 0.0 | 0 |
| 0.0 | 0 |
| 0.0 | 0 |
| 0.0 | 0 |
| 0.0 | 0 |
| 0.0 | 0 |
| 0.0 | 0 |
| 0.0 | 0 |
| 0.0 | 0 |
| 0.0 | 0 |
| 0.0 | 0 |
| 0.0 | 0 |
| 0.0 | 0 |
| 0.0 | 0 |
| 0.0 | 0 |
| 0.0 | 0 |
| 0.0 | 0 |
| 0.0 | 0 |
| 0.0 | 0 |
| 0.0 | 0 |
| 0.0 | 0 |
| 0.0 | 0 |
| 0.0 | 0 |
| 0.0 | 0 |
| 0.0 | 0 |
| 0.0 | 0 |
| 0.0 | 0 |
| 0.0 | 0 |
| 0.0 | 0 |
| 0.0 | 0 |
| 0.0 | 0 |
| 0.0 | 0 |
| 0.0 | 0 |
| 0.0 | 0 |
| 0.0 | 0 |
| 0.0 | 0 |
| 0.0 | 0 |
| 0.0 | 0 |
| 0.0 | 0 |
| 0.0 | 0 |
| 0.0 | 0 |
| 0.0 | 0 |
| 0.0 | 0 |
| 0.0 | 0 |
| 0.0 | 0 |
| 0.0 | 0 |
| 0.0 | 0 |
| 0.0 | 0 |
| 0.0 | 0 |
| 0.0 | 0 |
| 0.0 | 0 |
| 0.0 | 0 |
| 0.0 | 0 |
| 0.0 | 0 |
| 0.0 | 0 |
| 0.0 | 0 |
| 0.0 | 0 |
| 0.0 | 0 |
| 0.0 | 0 |
| 0.0 | 0 |
| 0.0 | 0 |
| 0.0 | 0 |
| 0.0 | 0 |
| 0.0 | 0 |
| 0.0 | 0 |
| 0.0 | 0 |
| 0.0 | 0 |
| 0.0 | 0 |
| 0.0 | 0 |
| 0.0 | 0 |
| 0.0 | 0 |
| 0.0 | 0 |
| 0.0 | 0 |
| 0.0 | 0 |
| 0.0 | 0 |
| 0.0 | 0 |
| 0.0 | 0 |
| 0.0 | 0 |
| 0.0 | 0 |
| 0.0 | 0 |
| 0.0 | 0 |
| 0.0 | 0 |
| 0.0 | 0 |
| 0.0 | 0 |
| 0.0 | 0 |
| 0.0 | 0 |
| 0.0 | 0 |
| 0.0 | 0 |
| 0.0 | 0 |
| 0.0 | 0 |
| 0.0 | 0 |
| 0.0 | 0 |
| 0.0 | 0 |
| 0.0 | 0 |
| 0.0 | 0 |
| 0.0 | 0 |
| 0.0 | 0 |
| 0.0 | 0 |
| 0.0 | 0 |
| 0.0 | 0 |
| 0.0 | 0 |
| 0.0 | 0 |
| 0.0 | 0 |
| 0.0 | 0 |
| 0.0 | 0 |
| 0.0 | 0 |
| 0.0 | 0 |
| 0.0 | 0 |
| 0.0 | 0 |
| 0.0 | 0 |
| 0.0 | 0 |
| 0.0 | 0 |
| 0.0 | 0 |
| 0.0 | 0 |
| 0.0 | 0 |
| 0.0 | 0 |
| 0.0 | 0 |
| 0.0 | 0 |
| 0.0 | 0 |
| 0.0 | 0 |
| 0.0 | 0 |
| 0.0 | 0 |
| 0.0 | 0 |
| 0.0 | 0 |
| 0.0 | 0 |
| 0.0 | 0 |
| 0.0 | 0 |
| 0.0 | 0 |
| 0.0 | 0 |
| 0.0 | 0 |
| 0.0 | 0 |
| 0.0 | 0 |
| 0.0 | 0 |
| 0.0 | 0 |
| 0.0 | 0 |
| 0.0 | 0 |
| 0.0 | 0 |
| 0.0 | 0 |
| 0.0 | 0 |
| 0.0 | 0 |
| 0.0 | 0 |
| 0.0 | 0 |
| 0.0 | 0 |
| 0.0 | 0 |
| 0.0 | 0 |
| 0.0 | 0 |
| 0.0 | 0 |
| 0.0 | 0 |
| 0.0 | 0 |
| 0.0 | 0 |
| 0.0 | 0 |
| 0.0 | 0 |
| 0.0 | 0 |
| 0.0 | 0 |
| 0.0 | 0 |
| 0.0 | 0 |
| 0.0 | 0 |
| 0.0 | 0 |
| 0.0 | 0 |
| 0.0 | 0 |
| 0.0 | 0 |
| 0.0 | 0 |
| 0.0 | 0 |
| 0.0 | 0 |
| 0.0 | 0 |
| 0.0 | 0 |
| 0.0 | 0 |
| 0.0 | 0 |
| 0.0 | 0 |
| 0.0 | 0 |
| 0.0 | 0 |
| 0.0 | 0 |
| 0.0 | 0 |
| 0.0 | 0 |
| 0.0 | 0 |
| 0.0 | 0 |
| 0.0 | 0 |
| 0.0 | 0 |
| 0.0 | 0 |
| 0.0 | 0 |
| 0.0 | 0 |
| 0.0 | 0 |
| 0.0 | 0 |
| 0.0 | 0 |
| 0.0 | 0 |
| 0.0 | 0 |
| 0.0 | 0 |
| 0.0 | 0 |
| 0.0 | 0 |
| 0.0 | 0 |
| 0.0 | 0 |
| 0.0 | 0 |
| 0.0 | 0 |
| 0.0 | 0 |
| 0.0 | 0 |
| 0.0 | 0 |
| 0.0 | 0 |
| 0.0 | 0 |
| 0.0 | 0 |
| 0.0 | 0 |
| 0.0 | 0 |
| 0.0 | 0 |
| 0.0 | 0 |
| 0.0 | 0 |
| 0.0 | 0 |
| 0.0 | 0 |
| 0.0 | 0 |
| 0.0 | 0 |
| 0.0 | 0 |
| 0.0 | 0 |
| 0.0 | 0 |
| 0.0 | 0 |
| 0.0 | 0 |
| 0.0 | 0 |
| 0.0 | 0 |
| 0.0 | 0 |
| 0.0 | 0 |
| 0.0 | 0 |
| 0.0 | 0 |
| 0.0 | 0 |
| 0.0 | 0 |
| 0.0 | 0 |
| 0.0 | 0 |
| 0.0 | 0 |
| 0.0 | 0 |
| 0.0 | 0 |
| 0.0 | 0 |
| 0.0 | 0 |
| 0.0 | 0 |
| 0.0 | 0 |
| 0.0 | 0 |
| 0.0 | 0 |
| 0.0 | 0 |
| 0.0 | 0 |
| 0.0 | 0 |
| 0.0 | 0 |
| 0.0 | 0 |
| 0.0 | 0 |
| 0.0 | 0 |
| 0.0 | 0 |
| 0.0 | 0 |
| 0.0 | 0 |
| 0.0 | 0 |
| 0.0 | 0 |
| 0.0 | 0 |
| 0.0 | 0 |
| 0.0 | 0 |
| 0.0 | 0 |
| 0.0 | 0 |
| 0.0 | 0 |
| 0.0 | 0 |
| 0.0 | 0 |
| 0.0 | 0 |
| 0.0 | 0 |
| 0.0 | 0 |
| 0.0 | 0 |
| 0.0 | 0 |
| 0.0 | 0 |
| 0.0 | 0 |
| 0.0 | 0 |
| 0.0 | 0 |
| 0.0 | 0 |
| 0.0 | 0 |
| 0.0 | 0 |
| 0.0 | 0 |
| 0.0 | 0 |
| 0.0 | 0 |
| 0.0 | 0 |
| 0.0 | 0 |
| 0.0 | 0 |
| 0.0 | 0 |
| 0.0 | 0 |
| 0.0 | 0 |
| 0.0 | 0 |
| 0.0 | 0 |
| 0.0 | 0 |
| 0.0 | 0 |
| 0.0 | 0 |
| 0.0 | 0 |
| 0.0 | 0 |
| 0.0 | 0 |
| 0.0 | 0 |
| 0.0 | 0 |
| 0.0 | 0 |
| 0.0 | 0 |
| 0.0 | 0 |
| 0.0 | 0 |
| 0.0 | 0 |
| 0.0 | 0 |
| 0.0 | 0 |
| 0.0 | 0 |
| 0.0 | 0 |
| 0.0 | 0 |
| 0.0 | 0 |
| 0.0 | 0 |
| 0.0 | 0 |
| 0.0 | 0 |
| 0.0 | 0 |
| 0.0 | 0 |
| 0.0 | 0 |
| 0.0 | 0 |
| 0.0 | 0 |
| 0.0 | 0 |
| 0.0 | 0 |
| 0.0 | 0 |
| 0.0 | 0 |
| 0.0 | 0 |
| 0.0 | 0 |
| 0.0 | 0 |
| 0.0 | 0 |
| 0.0 | 0 |
| 0.0 | 0 |
| 0.0 | 0 |
| 0.0 | 0 |
| 0.0 | 0 |
| 0.0 | 0 |
| 0.0 | 0 |
| 0.0 | 0 |
| 0.0 | 0 |
| 0.0 | 0 |
| 0.0 | 0 |
| 0.0 | 0 |
| 0.0 | 0 |
| 0.0 | 0 |
| 0.0 | 0 |
| 0.0 | 0 |
| 0.0 | 0 |
| 0.0 | 0 |
| 0.0 | 0 |
| 0.0 | 0 |
| 0.0 | 0 |
| 0.0 | 0 |
| 0.0 | 0 |
| 0.0 | 0 |
| 0.0 | 0 |
| 0.0 | 0 |
| 0.0 | 0 |
| 0.0 | 0 |
| 0.0 | 0 |
| 0.0 | 0 |
| 0.0 | 0 |
| 0.0 | 0 |
| 0.0 | 0 |
| 0.0 | 0 |
| 0.0 | 0 |
| 0.0 | 0 |
| 0.0 | 0 |
| 0.0 | 0 |
| 0.0 | 0 |
| 0.0 | 0 |
| 0.0 | 0 |
| 0.0 | 0 |
| 0.0 | 0 |
| 0.0 | 0 |
| 0.0 | 0 |
| 0.0 | 0 |
| 0.0 | 0 |
| 0.0 | 0 |
| 0.0 | 0 |
| 0.0 | 0 |
| 0.0 | 0 |
| 0.0 | 0 |
| 0.0 | 0 |
| 0.0 | 0 |
| 0.0 | 0 |
| 0.0 | 0 |
| 0.0 | 0 |
| 0.0 | 0 |
| 0.0 | 0 |
| 0.0 | 0 |
| 0.0 | 0 |
| 0.0 | 0 |
| 0.0 | 0 |
| 0.0 | 0 |
| 0.0 | 0 |
| 0.0 | 0 |
| 0.0 | 0 |
| 0.0 | 0 |
| 0.0 | 0 |
| 0.0 | 0 |
| 0.0 | 0 |
| 0.0 | 0 |
| 0.0 | 0 |
| 0.0 | 0 |
| 0.0 | 0 |
| 0.0 | 0 |
| 0.0 | 0 |
| 0.0 | 0 |
| 0.0 | 0 |
| 0.0 | 0 |
| 0.0 | 0 |
| 0.0 | 0 |
| 0.0 | 0 |
| 0.0 | 0 |
| 0.0 | 0 |
| 0.0 | 0 |
| 0.0 | 0 |
| 0.0 | 0 |
| 0.0 | 0 |
| 0.0 | 0 |
| 0.0 | 0 |
| 0.0 | 0 |
| 0.0 | 0 |
| 0.0 | 0 |
| 0.0 | 0 |
| 0.0 | 0 |
| 0.0 | 0 |
| 0.0 | 0 |
| 0.0 | 0 |
| 0.0 | 0 |
| 0.0 | 0 |
| 0.0 | 0 |
| 0.0 | 0 |
| 0.0 | 0 |
| 0.0 | 0 |
| 0.0 | 0 |
| 0.0 | 0 |
| 0.0 | 0 |
| 0.0 | 0 |
| 0.0 | 0 |
| 0.0 | 0 |
| 0.0 | 0 |
| 0.0 | 0 |
| 0.0 | 0 |
| 0.0 | 0 |
| 0.0 | 0 |
| 0.0 | 0 |
| 0.0 | 0 |
| 0.0 | 0 |
| 0.0 | 0 |
| 0.0 | 0 |
| 0.0 | 0 |
| 0.0 | 0 |
| 0.0 | 0 |
| 0.0 | 0 |
| 0.0 | 0 |
| 0.0 | 0 |
| 0.0 | 0 |
| 0.0 | 0 |
| 0.0 | 0 |
| 0.0 | 0 |
| 0.0 | 0 |
| 0.0 | 0 |
| 0.0 | 0 |
| 0.0 | 0 |
| 0.0 | 0 |
| 0.0 | 0 |
| 0.0 | 0 |
| 0.0 | 0 |
| 0.0 | 0 |
| 0.0 | 0 |
| 0.0 | 0 |
| 0.0 | 0 |
| 0.0 | 0 |
| 0.0 | 0 |
| 0.0 | 0 |
| 0.0 | 0 |
| 0.0 | 0 |
| 0.0 | 0 |
| 0.0 | 0 |
| 0.0 | 0 |
| 0.0 | 0 |
| 0.0 | 0 |
| 0.0 | 0 |
| 0.0 | 0 |
| 0.0 | 0 |
| 0.0 | 0 |
| 0.0 | 0 |
| 0.0 | 0 |
| 0.0 | 0 |
| 0.0 | 0 |
| 0.0 | 0 |
| 0.0 | 0 |
| 0.0 | 0 |
| 0.0 | 0 |
| 0.0 | 0 |
| 0.0 | 0 |
| 0.0 | 0 |
| 0.0 | 0 |
| 0.0 | 0 |
| 0.0 | 0 |
| 0.0 | 0 |
| 0.0 | 0 |
| 0.0 | 0 |
| 0.0 | 0 |
| 0.0 | 0 |
| 0.0 | 0 |
| 0.0 | 0 |
| 0.0 | 0 |
| 0.0 | 0 |
| 0.0 | 0 |
| 0.0 | 0 |
| 0.0 | 0 |
| 0.0 | 0 |
| 0.0 | 0 |
| 0.0 | 0 |
| 0.0 | 0 |
| 0.0 | 0 |
| 0.0 | 0 |
| 0.0 | 0 |
| 0.0 | 0 |
| 0.0 | 0 |
| 0.0 | 0 |
| 0.0 | 0 |
| 0.0 | 0 |
| 0.0 | 0 |
| 0.0 | 0 |
| 0.0 | 0 |
| 0.0 | 0 |
| 0.0 | 0 |
| 0.0 | 0 |
| 0.0 | 0 |
| 0.0 | 0 |
| 0.0 | 0 |
| 0.0 | 0 |
| 0.0 | 0 |
| 0.0 | 0 |
| 0.0 | 0 |
| 0.0 | 0 |
| 0.0 | 0 |
| 0.0 | 0 |
| 0.0 | 0 |
| 0.0 | 0 |
| 0.0 | 0 |
| 0.0 | 0 |
| 0.0 | 0 |
| 0.0 | 0 |
| 0.0 | 0 |
| 0.0 | 0 |
| 0.0 | 0 |
| 0.0 | 0 |
| 0.0 | 0 |
| 0.0 | 0 |
| 0.0 | 0 |
| 0.0 | 0 |
| 0.0 | 0 |
| 0.0 | 0 |
| 0.0 | 0 |
| 0.0 | 0 |
| 0.0 | 0 |
| 0.0 | 0 |
| 0.0 | 0 |
| 0.0 | 0 |
| 0.0 | 0 |
| 0.0 | 0 |
| 0.0 | 0 |
| 0.0 | 0 |
| 0.0 | 0 |
| 0.0 | 0 |
| 0.0 | 0 |
| 0.0 | 0 |
| 0.0 | 0 |
| 0.0 | 0 |
| 0.0 | 0 |
| 0.0 | 0 |
| 0.0 | 0 |
| 0.0 | 0 |
| 0.0 | 0 |
| 0.0 | 0 |
| 0.0 | 0 |
| 0.0 | 0 |
| 0.0 | 0 |
| 0.0 | 0 |
| 0.0 | 0 |
| 0.0 | 0 |
| 0.0 | 0 |
| 0.0 | 0 |
| 0.0 | 0 |
| 0.0 | 0 |
| 0.0 | 0 |
| 0.0 | 0 |
| 0.0 | 0 |
| 0.0 | 0 |
| 0.0 | 0 |
| 0.0 | 0 |
| 0.0 | 0 |
| 0.0 | 0 |
| 0.0 | 0 |
| 0.0 | 0 |
| 0.0 | 0 |
| 0.0 | 0 |
| 0.0 | 0 |
| 0.0 | 0 |
| 0.0 | 0 |
| 0.0 | 0 |
| 0.0 | 0 |
| 0.0 | 0 |
| 0.0 | 0 |
| 0.0 | 0 |
| 0.0 | 0 |
| 0.0 | 0 |
| 0.0 | 0 |
| 0.0 | 0 |
| 0.0 | 0 |
| 0.0 | 0 |
| 0.0 | 0 |
| 0.0 | 0 |
| 0.0 | 0 |
| 0.0 | 0 |
| 0.0 | 0 |
| 0.0 | 0 |
| 0.0 | 0 |
| 0.0 | 0 |
| 0.0 | 0 |
| 0.0 | 0 |
| 0.0 | 0 |
| 0.0 | 0 |
| 0.0 | 0 |
| 0.0 | 0 |
| 0.0 | 0 |
| 0.0 | 0 |
| 0.0 | 0 |
| 0.0 | 0 |
| 0.0 | 0 |
| 0.0 | 0 |
| 0.0 | 0 |
| 0.0 | 0 |
| 0.0 | 0 |
| 0.0 | 0 |
| 0.0 | 0 |
| 0.0 | 0 |
| 0.0 | 0 |
| 0.0 | 0 |
| 0.0 | 0 |
| 0.0 | 0 |
| 0.0 | 0 |
| 0.0 | 0 |
| 0.0 | 0 |
| 0.0 | 0 |
| 0.0 | 0 |
| 0.0 | 0 |
| 0.0 | 0 |
| 0.0 | 0 |
| 0.0 | 0 |
| 0.0 | 0 |
| 0.0 | 0 |
| 0.0 | 0 |
| 0.0 | 0 |
| 0.0 | 0 |
| 0.0 | 0 |
| 0.0 | 0 |
| 0.0 | 0 |
| 0.0 | 0 |
| 0.0 | 0 |
| 0.0 | 0 |
| 0.0 | 0 |
| 0.0 | 0 |
| 0.0 | 0 |
| 0.0 | 0 |
| 0.0 | 0 |
| 0.0 | 0 |
| 0.0 | 0 |
| 0.0 | 0 |
| 0.0 | 0 |
| 0.0 | 0 |
| 0.0 | 0 |
| 0.0 | 0 |
| 0.0 | 0 |
| 0.0 | 0 |
| 0.0 | 0 |
| 0.0 | 0 |
| 0.0 | 0 |
| 0.0 | 0 |
| 0.0 | 0 |
| 0.0 | 0 |
| 0.0 | 0 |
| 0.0 | 0 |
| 0.0 | 0 |
| 0.0 | 0 |
| 0.0 | 0 |
| 0.0 | 0 |
| 0.0 | 0 |
| 0.0 | 0 |
| 0.0 | 0 |
| 0.0 | 0 |
| 0.0 | 0 |
| 0.0 | 0 |
| 0.0 | 0 |
| 0.0 | 0 |
| 0.0 | 0 |
| 0.0 | 0 |
| 0.0 | 0 |
| 0.0 | 0 |
| 0.0 | 0 |
| 0.0 | 0 |
| 0.0 | 0 |
| 0.0 | 0 |
| 0.0 | 0 |
| 0.0 | 0 |
| 0.0 | 0 |
| 0.0 | 0 |
| 0.0 | 0 |
| 0.0 | 0 |
| 0.0 | 0 |
| 0.0 | 0 |
| 0.0 | 0 |
| 0.0 | 0 |
| 0.0 | 0 |
| 0.0 | 0 |
| 0.0 | 0 |
| 0.0 | 0 |
| 0.0 | 0 |
| 0.0 | 0 |
| 0.0 | 0 |
| 0.0 | 0 |
| 0.0 | 0 |
| 0.0 | 0 |
| 0.0 | 0 |
| 0.0 | 0 |
| 0.0 | 0 |
| 0.0 | 0 |
| 0.0 | 0 |
| 0.0 | 0 |
| 0.0 | 0 |
| 0.0 | 0 |
| 0.0 | 0 |
| 0.0 | 0 |
| 0.0 | 0 |
| 0.0 | 0 |
| 0.0 | 0 |
| 0.0 | 0 |
| 0.0 | 0 |
| 0.0 | 0 |
| 0.0 | 0 |
| 0.0 | 0 |
| 0.0 | 0 |
| 0.0 | 0 |
| 0.0 | 0 |
| 0.0 | 0 |
| 0.0 | 0 |
| 0.0 | 0 |
| 0.0 | 0 |
| 0.0 | 0 |
| 0.0 | 0 |
| 0.0 | 0 |
| 0.0 | 0 |
| 0.0 | 0 |
| 0.0 | 0 |
| 0.0 | 0 |
| 0.0 | 0 |
| 0.0 | 0 |
| 0.0 | 0 |
| 0.0 | 0 |
| 0.0 | 0 |
| 0.0 | 0 |
| 0.0 | 0 |
| 0.0 | 0 |
| 0.0 | 0 |
| 0.0 | 0 |
| 0.0 | 0 |
| 0.0 | 0 |
| 0.0 | 0 |
| 0.0 | 0 |
| 0.0 | 0 |
| 0.0 | 0 |
| 0.0 | 0 |
| 0.0 | 0 |
| 0.0 | 0 |
| 0.0 | 0 |
| 0.0 | 0 |
| 0.0 | 0 |
| 0.0 | 0 |
| 0.0 | 0 |
| 0.0 | 0 |
| 0.0 | 0 |
| 0.0 | 0 |
| 0.0 | 0 |
| 0.0 | 0 |
| 0.0 | 0 |
| 0.0 | 0 |
| 0.0 | 0 |
| 0.0 | 0 |
| 0.0 | 0 |
| 0.0 | 0 |
| 0.0 | 0 |
| 0.0 | 0 |
| 0.0 | 0 |
| 0.0 | 0 |
| 0.0 | 0 |
| 0.0 | 0 |
| 0.0 | 0 |
| 0.0 | 0 |
| 0.0 | 0 |
| 0.0 | 0 |
| 0.0 | 0 |
| 0.0 | 0 |
| 0.0 | 0 |
| 0.0 | 0 |
| 0.0 | 0 |
| 0.0 | 0 |
| 0.0 | 0 |
| 0.0 | 0 |
| 0.0 | 0 |
| 0.0 | 0 |
| 0.0 | 0 |
| 0.0 | 0 |
| 0.0 | 0 |
| 0.0 | 0 |
| 0.0 | 0 |
| 0.0 | 0 |
| 0.0 | 0 |
| 0.0 | 0 |
| 0.0 | 0 |
| 0.0 | 0 |
| 0.0 | 0 |
| 0.0 | 0 |
| 0.0 | 0 |
| 0.0 | 0 |
| 0.0 | 0 |
| 0.0 | 0 |
| 0.0 | 0 |
| 0.0 | 0 |
| 0.0 | 0 |
| 0.0 | 0 |
| 0.0 | 0 |
| 0.0 | 0 |
| 0.0 | 0 |
| 0.0 | 0 |
| 0.0 | 0 |
| 0.0 | 0 |
| 0.0 | 0 |
| 0.0 | 0 |
| 0.0 | 0 |
| 0.0 | 0 |
| 0.0 | 0 |
| 0.0 | 0 |
| 0.0 | 0 |
| 0.0 | 0 |
| 0.0 | 0 |
| 0.0 | 0 |
| 0.0 | 0 |
| 0.0 | 0 |
| 0.0 | 0 |
| 0.0 | 0 |
| 0.0 | 0 |
| 0.0 | 0 |
| 0.0 | 0 |
| 0.0 | 0 |
| 0.0 | 0 |
| 0.0 | 0 |
| 0.0 | 0 |
| 0.0 | 0 |
| 0.0 | 0 |
| 0.0 | 0 |
| 0.0 | 0 |
| 0.0 | 0 |
| 0.0 | 0 |
| 0.0 | 0 |
| 0.0 | 0 |
| 0.0 | 0 |
| 0.0 | 0 |
| 0.0 | 0 |
| 0.0 | 0 |
| 0.0 | 0 |
| 0.0 | 0 |
| 0.0 | 0 |
| 0.0 | 0 |
| 0.0 | 0 |
| 0.0 | 0 |
| 0.0 | 0 |
| 0.0 | 0 |
| 0.0 | 0 |
| 0.0 | 0 |
| 0.0 | 0 |
| 0.0 | 0 |
| 0.0 | 0 |
| 0.0 | 0 |
| 0.0 | 0 |
| 0.0 | 0 |
| 0.0 | 0 |
| 0.0 | 0 |
| 0.0 | 0 |
| 0.0 | 0 |
| 0.0 | 0 |
| 0.0 | 0 |
| 0.0 | 0 |
| 0.0 | 0 |
| 0.0 | 0 |
| 0.0 | 0 |
| 0.0 | 0 |
| 0.0 | 0 |
| 0.0 | 0 |
| 0.0 | 0 |
| 0.0 | 0 |
| 0.0 | 0 |
| 0.0 | 0 |
| 0.0 | 0 |
| 0.0 | 0 |
| 0.0 | 0 |
| 0.0 | 0 |
| 0.0 | 0 |
| 0.0 | 0 |
| 0.0 | 0 |
| 0.0 | 0 |
| 0.0 | 0 |
| 0.0 | 0 |
| 0.0 | 0 |
| 0.0 | 0 |
| 0.0 | 0 |
| 0.0 | 0 |
| 0.0 | 0 |
| 0.0 | 0 |
| 0.0 | 0 |
| 0.0 | 0 |
| 0.0 | 0 |
| 0.0 | 0 |
| 0.0 | 0 |
| 0.0 | 0 |
| 0.0 | 0 |
| 0.0 | 0 |
| 0.0 | 0 |
| 0.0 | 0 |
| 0.0 | 0 |
| 0.0 | 0 |
| 0.0 | 0 |
| 0.0 | 0 |
| 0.0 | 0 |
| 0.0 | 0 |
| 0.0 | 0 |
| 0.0 | 0 |
| 0.0 | 0 |
| 0.0 | 0 |
| 0.0 | 0 |
| 0.0 | 0 |
| 0.0 | 0 |
| 0.0 | 0 |
| 0.0 | 0 |
| 0.0 | 0 |
| 0.0 | 0 |
| 0.0 | 0 |
| 0.0 | 0 |
| 0.0 | 0 |
| 0.0 | 0 |
| 0.0 | 0 |
| 0.0 | 0 |
| 0.0 | 0 |
| 0.0 | 0 |
| 0.0 | 0 |
| 0.0 | 0 |
| 0.0 | 0 |
| 0.0 | 0 |
| 0.0 | 0 |
| 0.0 | 0 |
| 0.0 | 0 |
| 0.0 | 0 |
| 0.0 | 0 |
| 0.0 | 0 |
| 0.0 | 0 |
| 0.0 | 0 |
| 0.0 | 0 |
| 0.0 | 0 |
| 0.0 | 0 |
| 0.0 | 0 |
| 0.0 | 0 |
| 0.0 | 0 |
| 0.0 | 0 |
| 0.0 | 0 |
| 0.0 | 0 |
| 0.0 | 0 |
| 0.0 | 0 |
| 0.0 | 0 |
| 0.0 | 0 |
| 0.0 | 0 |
| 0.0 | 0 |
| 0.0 | 0 |
| 0.0 | 0 |
| 0.0 | 0 |
| 0.0 | 0 |
| 0.0 | 0 |
| 0.0 | 0 |
| 0.0 | 0 |
| 0.0 | 0 |
| 0.0 | 0 |
| 0.0 | 0 |
| 0.0 | 0 |
| 0.0 | 0 |
| 0.0 | 0 |
| 0.0 | 0 |
| 0.0 | 0 |
| 0.0 | 0 |
| 0.0 | 0 |
| 0.0 | 0 |
| 0.0 | 0 |
| 0.0 | 0 |
| 0.0 | 0 |
| 0.0 | 0 |
| 0.0 | 0 |
| 0.0 | 0 |
| 0.0 | 0 |
| 0.0 | 0 |
| 0.0 | 0 |
| 0.0 | 0 |
| 0.0 | 0 |
| 0.0 | 0 |
| 0.0 | 0 |
| 0.0 | 0 |
| 0.0 | 0 |
| 0.0 | 0 |
| 0.0 | 0 |
| 0.0 | 0 |
| 0.0 | 0 |
| 0.0 | 0 |
| 0.0 | 0 |
| 0.0 | 0 |
| 0.0 | 0 |
| 0.0 | 0 |
| 0.0 | 0 |
| 0.0 | 0 |
| 0.0 | 0 |
| 0.0 | 0 |
| 0.0 | 0 |
| 0.0 | 0 |
| 0.0 | 0 |
| 0.0 | 0 |
| 0.0 | 0 |
| 0.0 | 0 |
| 0.0 | 0 |
| 0.0 | 0 |
| 0.0 | 0 |
| 0.0 | 0 |
| 0.0 | 0 |
| 0.0 | 0 |
| 0.0 | 0 |
| 0.0 | 0 |
| 0.0 | 0 |
| 0.0 | 0 |
| 0.0 | 0 |
| 0.0 | 0 |
| 0.0 | 0 |
| 0.0 | 0 |
| 0.0 | 0 |
| 0.0 | 0 |
| 0.0 | 0 |
| 0.0 | 0 |
| 0.0 | 0 |
| 0.0 | 0 |
| 0.0 | 0 |
| 0.0 | 0 |
| 0.0 | 0 |
| 0.0 | 0 |
| 0.0 | 0 |
| 0.0 | 0 |
| 0.0 | 0 |
| 0.0 | 0 |
| 0.0 | 0 |
| 0.0 | 0 |
| 0.0 | 0 |
| 0.0 | 0 |
| 0.0 | 0 |
| 0.0 | 0 |
| 0.0 | 0 |
| 0.0 | 0 |
| 0.0 | 0 |
| 0.0 | 0 |
| 0.0 | 0 |
| 0.0 | 0 |
| 0.0 | 0 |
| 0.0 | 0 |
| 0.0 | 0 |
| 0.0 | 0 |
| 0.0 | 0 |
| 0.0 | 0 |
| 0.0 | 0 |
| 0.0 | 0 |
| 0.0 | 0 |
| 0.0 | 0 |
| 0.0 | 0 |
| 0.0 | 0 |
| 0.0 | 0 |
| 0.0 | 0 |
| 0.0 | 0 |
| 0.0 | 0 |
| 0.0 | 0 |
| 0.0 | 0 |
| 0.0 | 0 |
| 0.0 | 0 |
| 0.0 | 0 |
| 0.0 | 0 |
| 0.0 | 0 |
| 0.0 | 0 |
| 0.0 | 0 |
| 0.0 | 0 |
| 0.0 | 0 |
| 0.0 | 0 |
| 0.0 | 0 |
| 0.0 | 0 |
| 0.0 | 0 |
| 0.0 | 0 |
| 0.0 | 0 |
| 0.0 | 0 |
| 0.0 | 0 |
| 0.0 | 0 |
| 0.0 | 0 |
| 0.0 | 0 |
| 0.0 | 0 |
| 0.0 | 0 |
| 0.0 | 0 |
| 0.0 | 0 |
| 0.0 | 0 |
| 0.0 | 0 |
| 0.0 | 0 |
| 0.0 | 0 |
| 0.0 | 0 |
| 0.0 | 0 |
| 0.0 | 0 |
| 0.0 | 0 |
| 0.0 | 0 |
| 0.0 | 0 |
| 0.0 | 0 |
| 0.0 | 0 |
| 0.0 | 0 |
| 0.0 | 0 |
| 0.0 | 0 |
| 0.0 | 0 |
| 0.0 | 0 |
| 0.0 | 0 |
| 0.0 | 0 |
| 0.0 | 0 |
| 0.0 | 0 |
| 0.0 | 0 |
| 0.0 | 0 |
| 0.0 | 0 |
| 0.0 | 0 |
| 0.0 | 0 |
| 0.0 | 0 |
| 0.0 | 0 |
| 0.0 | 0 |
| 0.0 | 0 |
| 0.0 | 0 |
| 0.0 | 0 |
| 0.0 | 0 |
| 0.0 | 0 |
| 0.0 | 0 |
| 0.0 | 0 |
| 0.0 | 0 |
| 0.0 | 0 |
| 0.0 | 0 |
| 0.0 | 0 |
| 0.0 | 0 |
| 0.0 | 0 |
| 0.0 | 0 |
| 0.0 | 0 |
| 0.0 | 0 |
| 0.0 | 0 |
| 0.0 | 0 |
| 0.0 | 0 |
| 0.0 | 0 |
| 0.0 | 0 |
| 0.0 | 0 |
| 0.0 | 0 |
| 0.0 | 0 |
| 0.0 | 0 |
| 0.0 | 0 |
| 0.0 | 0 |
| 0.0 | 0 |
| 0.0 | 0 |
| 0.0 | 0 |
| 0.0 | 0 |
| 0.0 | 0 |
| 0.0 | 0 |
| 0.0 | 0 |
| 0.0 | 0 |
| 0.0 | 0 |
| 0.0 | 0 |
| 0.0 | 0 |
| 0.0 | 0 |
| 0.0 | 0 |
| 0.0 | 0 |
| 0.0 | 0 |
| 0.0 | 0 |
| 0.0 | 0 |
| 0.0 | 0 |
| 0.0 | 0 |
| 0.0 | 0 |
| 0.0 | 0 |
| 0.0 | 0 |
| 0.0 | 0 |
| 0.0 | 0 |
| 0.0 | 0 |
| 0.0 | 0 |
| 0.0 | 0 |
| 0.0 | 0 |
| 0.0 | 0 |
| 0.0 | 0 |
| 0.0 | 0 |
| 0.0 | 0 |
| 0.0 | 0 |
| 0.0 | 0 |
| 0.0 | 0 |
| 0.0 | 0 |
| 0.0 | 0 |
| 0.0 | 0 |
| 0.0 | 0 |
| 0.0 | 0 |
| 0.0 | 0 |
| 0.0 | 0 |
| 0.0 | 0 |
| 0.0 | 0 |
| 0.0 | 0 |
| 0.0 | 0 |
| 0.0 | 0 |
| 0.0 | 0 |
| 0.0 | 0 |
| 0.0 | 0 |
| 0.0 | 0 |
| 0.0 | 0 |
| 0.0 | 0 |
| 0.0 | 0 |
| 0.0 | 0 |
| 0.0 | 0 |
| 0.0 | 0 |
| 0.0 | 0 |
| 0.0 | 0 |
| 0.0 | 0 |
| 0.0 | 0 |
| 0.0 | 0 |
| 0.0 | 0 |
| 0.0 | 0 |
| 0.0 | 0 |
| 0.0 | 0 |
| 0.0 | 0 |
| 0.0 | 0 |
| 0.0 | 0 |
| 0.0 | 0 |
| 0.0 | 0 |
| 0.0 | 0 |
| 0.0 | 0 |
| 0.0 | 0 |
| 0.0 | 0 |
| 0.0 | 0 |
| 0.0 | 0 |
| 0.0 | 0 |
| 0.0 | 0 |
| 0.0 | 0 |
| 0.0 | 0 |
| 0.0 | 0 |
| 0.0 | 0 |
| 0.0 | 0 |
| 0.0 | 0 |
| 0.0 | 0 |
| 0.0 | 0 |
| 0.0 | 0 |
| 0.0 | 0 |
| 0.0 | 0 |
| 0.0 | 0 |
| 0.0 | 0 |
| 0.0 | 0 |
| 0.0 | 0 |
| 0.0 | 0 |
| 0.0 | 0 |
| 0.0 | 0 |
| 0.0 | 0 |
| 0.0 | 0 |
| 0.0 | 0 |
| 0.0 | 0 |
| 0.0 | 0 |
| 0.0 | 0 |
| 0.0 | 0 |
| 0.0 | 0 |
| 0.0 | 0 |
| 0.0 | 0 |
| 0.0 | 0 |
| 0.0 | 0 |
| 0.0 | 0 |
| 0.0 | 0 |
| 0.0 | 0 |
| 0.0 | 0 |
| 0.0 | 0 |
| 0.0 | 0 |
| 0.0 | 0 |
| 0.0 | 0 |
| 0.0 | 0 |
| 0.0 | 0 |
| 0.0 | 0 |
| 0.0 | 0 |
| 0.0 | 0 |
| 0.0 | 0 |
| 0.0 | 0 |
| 0.0 | 0 |
| 0.0 | 0 |
| 0.0 | 0 |
| 0.0 | 0 |
| 0.0 | 0 |
| 0.0 | 0 |
| 0.0 | 0 |
| 0.0 | 0 |
| 0.0 | 0 |
| 0.0 | 0 |
| 0.0 | 0 |
| 0.0 | 0 |
| 0.0 | 0 |
| 0.0 | 0 |
| 0.0 | 0 |
| 0.0 | 0 |
| 0.0 | 0 |
| 0.0 | 0 |
| 0.0 | 0 |
| 0.0 | 0 |
| 0.0 | 0 |
| 0.0 | 0 |
| 0.0 | 0 |
| 0.0 | 0 |
| 0.0 | 0 |
| 0.0 | 0 |
| 0.0 | 0 |
| 0.0 | 0 |
| 0.0 | 0 |
| 0.0 | 0 |
| 0.0 | 0 |
| 0.0 | 0 |
| 0.0 | 0 |
| 0.0 | 0 |
| 0.0 | 0 |
| 0.0 | 0 |
| 0.0 | 0 |
| 0.0 | 0 |
| 0.0 | 0 |
| 0.0 | 0 |
| 0.0 | 0 |
| 0.0 | 0 |
| 0.0 | 0 |
| 0.0 | 0 |
| 0.0 | 0 |
| 0.0 | 0 |
| 0.0 | 0 |
| 0.0 | 0 |
| 0.0 | 0 |
| 0.0 | 0 |
| 0.0 | 0 |
| 0.0 | 0 |
| 0.0 | 0 |
| 0.0 | 0 |
| 0.0 | 0 |
| 0.0 | 0 |
| 0.0 | 0 |
| 0.0 | 0 |
| 0.0 | 0 |
| 0.0 | 0 |
| 0.0 | 0 |
| 0.0 | 0 |
| 0.0 | 0 |
| 0.0 | 0 |
| 0.0 | 0 |
| 0.0 | 0 |
| 0.0 | 0 |
| 0.0 | 0 |
| 0.0 | 0 |
| 0.0 | 0 |
| 0.0 | 0 |
| 0.0 | 0 |
| 0.0 | 0 |
| 0.0 | 0 |
| 0.0 | 0 |
| 0.0 | 0 |
| 0.0 | 0 |
| 0.0 | 0 |
| 0.0 | 0 |
| 0.0 | 0 |
| 0.0 | 0 |
| 0.0 | 0 |
| 0.0 | 0 |
| 0.0 | 0 |
| 0.0 | 0 |
| 0.0 | 0 |
| 0.0 | 0 |
| 0.0 | 0 |
| 0.0 | 0 |
| 0.0 | 0 |
| 0.0 | 0 |
| 0.0 | 0 |
| 0.0 | 0 |
| 0.0 | 0 |
| 0.0 | 0 |
| 0.0 | 0 |
| 0.0 | 0 |
| 0.0 | 0 |
| 0.0 | 0 |
| 0.0 | 0 |
| 0.0 | 0 |
| 0.0 | 0 |
| 0.0 | 0 |
| 0.0 | 0 |
| 0.0 | 0 |
| 0.0 | 0 |
| 0.0 | 0 |
| 0.0 | 0 |
| 0.0 | 0 |
| 0.0 | 0 |
| 0.0 | 0 |
| 0.0 | 0 |
| 0.0 | 0 |
| 0.0 | 0 |
| 0.0 | 0 |
| 0.0 | 0 |
| 0.0 | 0 |
| 0.0 | 0 |
| 0.0 | 0 |
| 0.0 | 0 |
| 0.0 | 0 |
| 0.0 | 0 |
| 0.0 | 0 |
| 0.0 | 0 |
| 0.0 | 0 |
| 0.0 | 0 |
| 0.0 | 0 |
| 0.0 | 0 |
| 0.0 | 0 |
| 0.0 | 0 |
| 0.0 | 0 |
| 0.0 | 0 |
| 0.0 | 0 |
| 0.0 | 0 |
| 0.0 | 0 |
| 0.0 | 0 |
| 0.0 | 0 |
| 0.0 | 0 |
| 0.0 | 0 |
| 0.0 | 0 |
| 0.0 | 0 |
| 0.0 | 0 |
| 0.0 | 0 |
| 0.0 | 0 |
| 0.0 | 0 |
| 0.0 | 0 |
| 0.0 | 0 |
| 0.0 | 0 |
| 0.0 | 0 |
| 0.0 | 0 |
| 0.0 | 0 |
| 0.0 | 0 |
| 0.0 | 0 |
| 0.0 | 0 |
| 0.0 | 0 |
| 0.0 | 0 |
| 0.0 | 0 |
| 0.0 | 0 |
| 0.0 | 0 |
| 0.0 | 0 |
| 0.0 | 0 |
| 0.0 | 0 |
| 0.0 | 0 |
| 0.0 | 0 |
| 0.0 | 0 |
| 0.0 | 0 |
| 0.0 | 0 |
| 0.0 | 0 |
| 0.0 | 0 |
| 0.0 | 0 |
| 0.0 | 0 |
| 0.0 | 0 |
| 0.0 | 0 |
| 0.0 | 0 |
| 0.0 | 0 |
| 0.0 | 0 |
| 0.0 | 0 |
| 0.0 | 0 |
| 0.0 | 0 |
| 0.0 | 0 |
| 0.0 | 0 |
| 0.0 | 0 |
| 0.0 | 0 |
| 0.0 | 0 |
| 0.0 | 0 |
| 0.0 | 0 |
| 0.0 | 0 |
| 0.0 | 0 |
| 0.0 | 0 |
| 0.0 | 0 |
| 0.0 | 0 |
| 0.0 | 0 |
| 0.0 | 0 |
| 0.0 | 0 |
| 0.0 | 0 |
| 0.0 | 0 |
| 0.0 | 0 |
| 0.0 | 0 |
| 0.0 | 0 |
| 0.0 | 0 |
| 0.0 | 0 |
| 0.0 | 0 |
| 0.0 | 0 |
| 0.0 | 0 |
| 0.0 | 0 |
| 0.0 | 0 |
| 0.0 | 0 |
| 0.0 | 0 |
| 0.0 | 0 |
| 0.0 | 0 |
| 0.0 | 0 |
| 0.0 | 0 |
| 0.0 | 0 |
| 0.0 | 0 |
| 0.0 | 0 |
| 0.0 | 0 |
| 0.0 | 0 |
| 0.0 | 0 |
| 0.0 | 0 |
| 0.0 | 0 |
| 0.0 | 0 |
| 0.0 | 0 |
| 0.0 | 0 |
| 0.0 | 0 |
| 0.0 | 0 |
| 0.0 | 0 |
| 0.0 | 0 |
| 0.0 | 0 |
| 0.0 | 0 |
| 0.0 | 0 |
| 0.0 | 0 |
| 0.0 | 0 |
| 0.0 | 0 |
| 0.0 | 0 |
| 0.0 | 0 |
| 0.0 | 0 |
| 0.0 | 0 |
| 0.0 | 0 |
| 0.0 | 0 |
| 0.0 | 0 |
| 0.0 | 0 |
| 0.0 | 0 |
| 0.0 | 0 |
| 0.0 | 0 |
| 0.0 | 0 |
| 0.0 | 0 |
| 0.0 | 0 |
| 0.0 | 0 |
| 0.0 | 0 |
| 0.0 | 0 |
| 0.0 | 0 |
| 0.0 | 0 |
| 0.0 | 0 |
| 0.0 | 0 |
| 0.0 | 0 |
| 0.0 | 0 |
| 0.0 | 0 |
| 0.0 | 0 |
| 0.0 | 0 |
| 0.0 | 0 |
| 0.0 | 0 |
| 0.0 | 0 |
| 0.0 | 0 |
| 0.0 | 0 |
| 0.0 | 0 |
| 0.0 | 0 |
| 0.0 | 0 |
| 0.0 | 0 |
| 0.0 | 0 |
| 0.0 | 0 |
| 0.0 | 0 |
| 0.0 | 0 |
| 0.0 | 0 |
| 0.0 | 0 |
| 0.0 | 0 |
| 0.0 | 0 |
| 0.0 | 0 |
| 0.0 | 0 |
| 0.0 | 0 |
| 0.0 | 0 |
| 0.0 | 0 |
| 0.0 | 0 |
| 0.0 | 0 |
| 0.0 | 0 |
| 0.0 | 0 |
| 0.0 | 0 |
| 0.0 | 0 |
| 0.0 | 0 |
| 0.0 | 0 |
| 0.0 | 0 |
| 0.0 | 0 |
| 0.0 | 0 |
| 0.0 | 0 |
| 0.0 | 0 |
| 0.0 | 0 |
| 0.0 | 0 |
| 0.0 | 0 |
| 0.0 | 0 |
| 0.0 | 0 |
| 0.0 | 0 |
| 0.0 | 0 |
| 0.0 | 0 |
| 0.0 | 0 |
| 0.0 | 0 |
| 0.0 | 0 |
| 0.0 | 0 |
| 0.0 | 0 |
| 0.0 | 0 |
| 0.0 | 0 |
| 0.0 | 0 |
| 0.0 | 0 |
| 0.0 | 0 |
| 0.0 | 0 |
| 0.0 | 0 |
| 0.0 | 0 |
| 0.0 | 0 |
| 0.0 | 0 |
| 0.0 | 0 |
| 0.0 | 0 |
| 0.0 | 0 |
| 0.0 | 0 |
| 0.0 | 0 |
| 0.0 | 0 |
| 0.0 | 0 |
| 0.0 | 0 |
| 0.0 | 0 |
| 0.0 | 0 |
| 0.0 | 0 |
| 0.0 | 0 |
| 0.0 | 0 |
| 0.0 | 0 |
| 0.0 | 0 |
| 0.0 | 0 |
| 0.0 | 0 |
| 0.0 | 0 |
| 0.0 | 0 |
| 0.0 | 0 |
| 0.0 | 0 |
| 0.0 | 0 |
| 0.0 | 0 |
| 0.0 | 0 |
| 0.0 | 0 |
| 0.0 | 0 |
| 0.0 | 0 |
| 0.0 | 0 |
| 0.0 | 0 |
| 0.0 | 0 |
| 0.0 | 0 |
| 0.0 | 0 |
| 0.0 | 0 |
| 0.0 | 0 |
| 0.0 | 0 |
| 0.0 | 0 |
| 0.0 | 0 |
| 0.0 | 0 |
| 0.0 | 0 |
| 0.0 | 0 |
| 0.0 | 0 |
| 0.0 | 0 |
| 0.0 | 0 |
| 0.0 | 0 |
| 0.0 | 0 |
| 0.0 | 0 |
| 0.0 | 0 |
| 0.0 | 0 |
| 0.0 | 0 |
| 0.0 | 0 |
| 0.0 | 0 |
| 0.0 | 0 |
| 0.0 | 0 |
| 0.0 | 0 |
| 0.0 | 0 |
| 0.0 | 0 |
| 0.0 | 0 |
| 0.0 | 0 |
| 0.0 | 0 |
| 0.0 | 0 |
| 0.0 | 0 |
| 0.0 | 0 |
| 0.0 | 0 |
| 0.0 | 0 |
| 0.0 | 0 |
| 0.0 | 0 |
| 0.0 | 0 |
| 0.0 | 0 |
| 0.0 | 0 |
| 0.0 | 0 |
| 0.0 | 0 |
| 0.0 | 0 |
| 0.0 | 0 |
| 0.0 | 0 |
| 0.0 | 0 |
| 0.0 | 0 |
| 0.0 | 0 |
| 0.0 | 0 |
| 0.0 | 0 |
| 0.0 | 0 |
| 0.0 | 0 |
| 0.0 | 0 |
| 0.0 | 0 |
| 0.0 | 0 |
| 0.0 | 0 |
| 0.0 | 0 |
| 0.0 | 0 |
| 0.0 | 0 |
| 0.0 | 0 |
| 0.0 | 0 |
| 0.0 | 0 |
| 0.0 | 0 |
| 0.0 | 0 |
| 0.0 | 0 |
| 0.0 | 0 |
| 0.0 | 0 |
| 0.0 | 0 |
| 0.0 | 0 |
| 0.0 | 0 |
| 0.0 | 0 |
| 0.0 | 0 |
| 0.0 | 0 |
| 0.0 | 0 |
| 0.0 | 0 |
| 0.0 | 0 |
| 0.0 | 0 |
| 0.0 | 0 |
| 0.0 | 0 |
| 0.0 | 0 |
| 0.0 | 0 |
| 0.0 | 0 |
| 0.0 | 0 |
| 0.0 | 0 |
| 0.0 | 0 |
| 0.0 | 0 |
| 0.0 | 0 |
| 0.0 | 0 |
| 0.0 | 0 |
| 0.0 | 0 |
| 0.0 | 0 |
| 0.0 | 0 |
| 0.0 | 0 |
| 0.0 | 0 |
| 0.0 | 0 |
| 0.0 | 0 |
| 0.0 | 0 |
| 0.0 | 0 |
| 0.0 | 0 |
| 0.0 | 0 |
| 0.0 | 0 |
| 0.0 | 0 |
| 0.0 | 0 |
| 0.0 | 0 |
| 0.0 | 0 |
| 0.0 | 0 |
| 0.0 | 0 |
| 0.0 | 0 |
| 0.0 | 0 |
| 0.0 | 0 |
| 0.0 | 0 |
| 0.0 | 0 |
| 0.0 | 0 |
| 0.0 | 0 |
| 0.0 | 0 |
| 0.0 | 0 |
| 0.0 | 0 |
| 0.0 | 0 |
| 0.0 | 0 |
| 0.0 | 0 |
| 0.0 | 0 |
| 0.0 | 0 |
| 0.0 | 0 |
| 0.0 | 0 |
| 0.0 | 0 |
| 0.0 | 0 |
| 0.0 | 0 |
| 0.0 | 0 |
| 0.0 | 0 |
| 0.0 | 0 |
| 0.0 | 0 |
| 0.0 | 0 |
| 0.0 | 0 |
| 0.0 | 0 |
| 0.0 | 0 |
| 0.0 | 0 |
| 0.0 | 0 |
| 0.0 | 0 |
| 0.0 | 0 |
| 0.0 | 0 |
| 0.0 | 0 |
| 0.0 | 0 |
| 0.0 | 0 |
| 0.0 | 0 |
| 0.0 | 0 |
| 0.0 | 0 |
| 0.0 | 0 |
| 0.0 | 0 |
| 0.0 | 0 |
| 0.0 | 0 |
| 0.0 | 0 |
| 0.0 | 0 |
| 0.0 | 0 |
| 0.0 | 0 |
| 0.0 | 0 |
| 0.0 | 0 |
| 0.0 | 0 |
| 0.0 | 0 |
| 0.0 | 0 |
| 0.0 | 0 |
| 0.0 | 0 |
| 0.0 | 0 |
| 0.0 | 0 |
| 0.0 | 0 |
| 0.0 | 0 |
| 0.0 | 0 |
| 0.0 | 0 |
| 0.0 | 0 |
| 0.0 | 0 |
| 0.0 | 0 |
| 0.0 | 0 |
| 0.0 | 0 |
| 0.0 | 0 |
| 0.0 | 0 |
| 0.0 | 0 |
| 0.0 | 0 |
| 0.0 | 0 |
| 0.0 | 0 |
| 0.0 | 0 |
| 0.0 | 0 |
| 0.0 | 0 |
| 0.0 | 0 |
| 0.0 | 0 |
| 0.0 | 0 |
| 0.0 | 0 |
| 0.0 | 0 |
| 0.0 | 0 |
| 0.0 | 0 |
| 0.0 | 0 |
| 0.0 | 0 |
| 0.0 | 0 |
| 0.0 | 0 |
| 0.0 | 0 |
| 0.0 | 0 |
| 0.0 | 0 |
| 0.0 | 0 |
| 0.0 | 0 |
| 0.0 | 0 |
| 0.0 | 0 |
| 0.0 | 0 |
| 0.0 | 0 |
| 0.0 | 0 |
| 0.0 | 0 |
| 0.0 | 0 |
| 0.0 | 0 |
| 0.0 | 0 |
| 0.0 | 0 |
| 0.0 | 0 |
| 0.0 | 0 |
| 0.0 | 0 |
| 0.0 | 0 |
| 0.0 | 0 |
| 0.0 | 0 |
| 0.0 | 0 |
| 0.0 | 0 |
| 0.0 | 0 |
| 0.0 | 0 |
| 0.0 | 0 |
| 0.0 | 0 |
| 0.0 | 0 |
| 0.0 | 0 |
| 0.0 | 0 |
| 0.0 | 0 |
| 0.0 | 0 |
| 0.0 | 0 |
| 0.0 | 0 |
| 0.0 | 0 |
| 0.0 | 0 |
| 0.0 | 0 |
| 0.0 | 0 |
| 0.0 | 0 |
| 0.0 | 0 |
| 0.0 | 0 |
| 0.0 | 0 |
| 0.0 | 0 |
| 0.0 | 0 |
| 0.0 | 0 |
| 0.0 | 0 |
| 0.0 | 0 |
| 0.0 | 0 |
| 0.0 | 0 |
| 0.0 | 0 |
| 0.0 | 0 |
| 0.0 | 0 |
| 0.0 | 0 |
| 0.0 | 0 |
| 0.0 | 0 |
| 0.0 | 0 |
| 0.0 | 0 |
| 0.0 | 0 |
| 0.0 | 0 |
| 0.0 | 0 |
| 0.0 | 0 |
| 0.0 | 0 |
| 0.0 | 0 |
| 0.0 | 0 |
| 0.0 | 0 |
| 0.0 | 0 |
| 0.0 | 0 |
| 0.0 | 0 |
| 0.0 | 0 |
| 0.0 | 0 |
| 0.0 | 0 |
| 0.0 | 0 |
| 0.0 | 0 |
| 0.0 | 0 |
| 0.0 | 0 |
| 0.0 | 0 |
| 0.0 | 0 |
| 0.0 | 0 |
| 0.0 | 0 |
| 0.0 | 0 |
| 0.0 | 0 |
| 0.0 | 0 |
| 0.0 | 0 |
| 0.0 | 0 |
| 0.0 | 0 |
| 0.0 | 0 |
| 0.0 | 0 |
| 0.0 | 0 |
| 0.0 | 0 |
| 0.0 | 0 |
| 0.0 | 0 |
| 0.0 | 0 |
| 0.0 | 0 |
| 0.0 | 0 |
| 0.0 | 0 |
| 0.0 | 0 |
| 0.0 | 0 |
| 0.0 | 0 |
| 0.0 | 0 |
| 0.0 | 0 |
| 0.0 | 0 |
| 0.0 | 0 |
| 0.0 | 0 |
| 0.0 | 0 |
| 0.0 | 0 |
| 0.0 | 0 |
| 0.0 | 0 |
| 0.0 | 0 |
| 0.0 | 0 |
| 0.0 | 0 |
| 0.0 | 0 |
| 0.0 | 0 |
| 0.0 | 0 |
| 0.0 | 0 |
| 0.0 | 0 |
| 0.0 | 0 |
| 0.0 | 0 |
| 0.0 | 0 |
| 0.0 | 0 |
| 0.0 | 0 |
| 0.0 | 0 |
| 0.0 | 0 |
| 0.0 | 0 |
| 0.0 | 0 |
| 0.0 | 0 |
| 0.0 | 0 |
| 0.0 | 0 |
| 0.0 | 0 |
| 0.0 | 0 |
| 0.0 | 0 |
| 0.0 | 0 |
| 0.0 | 0 |
| 0.0 | 0 |
| 0.0 | 0 |
| 0.0 | 0 |
| 0.0 | 0 |
| 0.0 | 0 |
| 0.0 | 0 |
| 0.0 | 0 |
| 0.0 | 0 |
| 0.0 | 0 |
| 0.0 | 0 |
| 0.0 | 0 |
| 0.0 | 0 |
| 0.0 | 0 |
| 0.0 | 0 |
| 0.0 | 0 |
| 0.0 | 0 |
| 0.0 | 0 |
| 0.0 | 0 |
| 0.0 | 0 |
| 0.0 | 0 |
| 0.0 | 0 |
| 0.0 | 0 |
| 0.0 | 0 |
| 0.0 | 0 |
| 0.0 | 0 |
| 0.0 | 0 |
| 0.0 | 0 |
| 0.0 | 0 |
| 0.0 | 0 |
| 0.0 | 0 |
| 0.0 | 0 |
| 0.0 | 0 |
| 0.0 | 0 |
| 0.0 | 0 |
| 0.0 | 0 |
| 0.0 | 0 |
| 0.0 | 0 |
| 0.0 | 0 |
| 0.0 | 0 |
| 0.0 | 0 |
| 0.0 | 0 |
| 0.0 | 0 |
| 0.0 | 0 |
| 0.0 | 0 |
| 0.0 | 0 |
| 0.0 | 0 |
| 0.0 | 0 |
| 0.0 | 0 |
| 0.0 | 0 |
| 0.0 | 0 |
| 0.0 | 0 |
| 0.0 | 0 |
| 0.0 | 0 |
| 0.0 | 0 |
| 0.0 | 0 |
| 0.0 | 0 |
| 0.0 | 0 |
| 0.0 | 0 |
| 0.0 | 0 |
| 0.0 | 0 |
| 0.0 | 0 |
| 0.0 | 0 |
| 0.0 | 0 |
| 0.0 | 0 |
| 0.0 | 0 |
| 0.0 | 0 |
| 0.0 | 0 |
| 0.0 | 0 |
| 0.0 | 0 |
| 0.0 | 0 |
| 0.0 | 0 |
| 0.0 | 0 |
| 0.0 | 0 |
| 0.0 | 0 |
| 0.0 | 0 |
| 0.0 | 0 |
| 0.0 | 0 |
| 0.0 | 0 |
| 0.0 | 0 |
| 0.0 | 0 |
| 0.0 | 0 |
| 0.0 | 0 |
| 0.0 | 0 |
| 0.0 | 0 |
| 0.0 | 0 |
| 0.0 | 0 |
| 0.0 | 0 |
| 0.0 | 0 |
| 0.0 | 0 |
| 0.0 | 0 |
| 0.0 | 0 |
| 0.0 | 0 |
| 0.0 | 0 |
| 0.0 | 0 |
| 0.0 | 0 |
| 0.0 | 0 |
| 0.0 | 0 |
| 0.0 | 0 |
| 0.0 | 0 |
| 0.0 | 0 |
| 0.0 | 0 |
| 0.0 | 0 |
| 0.0 | 0 |
| 0.0 | 0 |
| 0.0 | 0 |
| 0.0 | 0 |
| 0.0 | 0 |
| 0.0 | 0 |
| 0.0 | 0 |
| 0.0 | 0 |
| 0.0 | 0 |
| 0.0 | 0 |
| 0.0 | 0 |
| 0.0 | 0 |
| 0.0 | 0 |
| 0.0 | 0 |
| 0.0 | 0 |
| 0.0 | 0 |
| 0.0 | 0 |
| 0.0 | 0 |
| 0.0 | 0 |
| 0.0 | 0 |
| 0.0 | 0 |
| 0.0 | 0 |
| 0.0 | 0 |
| 0.0 | 0 |
| 0.0 | 0 |
| 0.0 | 0 |
| 0.0 | 0 |
| 0.0 | 0 |
| 0.0 | 0 |
| 0.0 | 0 |
| 0.0 | 0 |
| 0.0 | 0 |
| 0.0 | 0 |
| 0.0 | 0 |
| 0.0 | 0 |
| 0.0 | 0 |
| 0.0 | 0 |
| 0.0 | 0 |
| 0.0 | 0 |
| 0.0 | 0 |
| 0.0 | 0 |
| 0.0 | 0 |
| 0.0 | 0 |
| 0.0 | 0 |
| 0.0 | 0 |
| 0.0 | 0 |
| 0.0 | 0 |
| 0.0 | 0 |
| 0.0 | 0 |
| 0.0 | 0 |
| 0.0 | 0 |
| 0.0 | 0 |
| 0.0 | 0 |
| 0.0 | 0 |
| 0.0 | 0 |
| 0.0 | 0 |
| 0.0 | 0 |
| 0.0 | 0 |
| 0.0 | 0 |
| 0.0 | 0 |
| 0.0 | 0 |
| 0.0 | 0 |
| 0.0 | 0 |
| 0.0 | 0 |
| 0.0 | 0 |
| 0.0 | 0 |
| 0.0 | 0 |
| 0.0 | 0 |
| 0.0 | 0 |
| 0.0 | 0 |
| 0.0 | 0 |
| 0.0 | 0 |
| 0.0 | 0 |
| 0.0 | 0 |
| 0.0 | 0 |
| 0.0 | 0 |
| 0.0 | 0 |
| 0.0 | 0 |
| 0.0 | 0 |
| 0.0 | 0 |
| 0.0 | 0 |
| 0.0 | 0 |
| 0.0 | 0 |
| 0.0 | 0 |
| 0.0 | 0 |
| 0.0 | 0 |
| 0.0 | 0 |
| 0.0 | 0 |
| 0.0 | 0 |
| 0.0 | 0 |
| 0.0 | 0 |
| 0.0 | 0 |
| 0.0 | 0 |
| 0.0 | 0 |
| 0.0 | 0 |
| 0.0 | 0 |
| 0.0 | 0 |
| 0.0 | 0 |
| 0.0 | 0 |
| 0.0 | 0 |
| 0.0 | 0 |
| 0.0 | 0 |
| 0.0 | 0 |
| 0.0 | 0 |
| 0.0 | 0 |
| 0.0 | 0 |
| 0.0 | 0 |
| 0.0 | 0 |
| 0.0 | 0 |
| 0.0 | 0 |
| 0.0 | 0 |
| 0.0 | 0 |
| 0.0 | 0 |
| 0.0 | 0 |
| 0.0 | 0 |
| 0.0 | 0 |
| 0.0 | 0 |
| 0.0 | 0 |
| 0.0 | 0 |
| 0.0 | 0 |
| 0.0 | 0 |
| 0.0 | 0 |
| 0.0 | 0 |
| 0.0 | 0 |
| 0.0 | 0 |
| 0.0 | 0 |
| 0.0 | 0 |
| 0.0 | 0 |
| 0.0 | 0 |
| 0.0 | 0 |
| 0.0 | 0 |
| 0.0 | 0 |
| 0.0 | 0 |
| 0.0 | 0 |
| 0.0 | 0 |
| 0.0 | 0 |
| 0.0 | 0 |
| 0.0 | 0 |
| 0.0 | 0 |
| 0.0 | 0 |
| 0.0 | 0 |
| 0.0 | 0 |
| 0.0 | 0 |
| 0.0 | 0 |
| 0.0 | 0 |
| 0.0 | 0 |
| 0.0 | 0 |
| 0.0 | 0 |